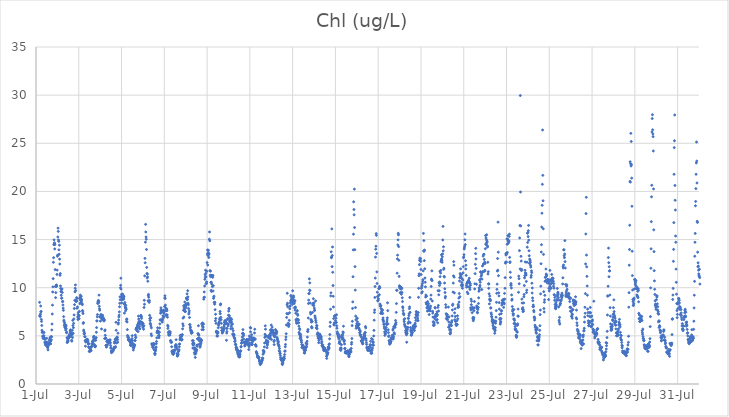
| Category | Chl (ug/L) |
|---|---|
| 44743.166666666664 | 8.48 |
| 44743.177083333336 | 7.07 |
| 44743.1875 | 7.12 |
| 44743.197916666664 | 7 |
| 44743.208333333336 | 7.26 |
| 44743.21875 | 8.1 |
| 44743.229166666664 | 7.49 |
| 44743.239583333336 | 7.54 |
| 44743.25 | 6.71 |
| 44743.260416666664 | 6.5 |
| 44743.270833333336 | 6.08 |
| 44743.28125 | 5.58 |
| 44743.291666666664 | 5.36 |
| 44743.302083333336 | 5.4 |
| 44743.3125 | 4.97 |
| 44743.322916666664 | 4.88 |
| 44743.333333333336 | 4.73 |
| 44743.34375 | 4.86 |
| 44743.354166666664 | 4.99 |
| 44743.364583333336 | 5.02 |
| 44743.375 | 5.35 |
| 44743.385416666664 | 4.82 |
| 44743.395833333336 | 4.7 |
| 44743.40625 | 4.7 |
| 44743.416666666664 | 4.29 |
| 44743.427083333336 | 4.41 |
| 44743.4375 | 4.23 |
| 44743.447916666664 | 4.08 |
| 44743.458333333336 | 4.05 |
| 44743.46875 | 4.03 |
| 44743.479166666664 | 4.09 |
| 44743.489583333336 | 4.31 |
| 44743.5 | 4.74 |
| 44743.510416666664 | 4.36 |
| 44743.520833333336 | 4.23 |
| 44743.53125 | 3.88 |
| 44743.541666666664 | 3.85 |
| 44743.552083333336 | 3.76 |
| 44743.5625 | 3.54 |
| 44743.572916666664 | 3.96 |
| 44743.583333333336 | 4.19 |
| 44743.59375 | 4.29 |
| 44743.604166666664 | 4.12 |
| 44743.614583333336 | 4.16 |
| 44743.625 | 4.55 |
| 44743.635416666664 | 4.23 |
| 44743.645833333336 | 4.78 |
| 44743.65625 | 4.63 |
| 44743.666666666664 | 4.44 |
| 44743.677083333336 | 4.41 |
| 44743.6875 | 4.17 |
| 44743.697916666664 | 4.91 |
| 44743.708333333336 | 4.89 |
| 44743.71875 | 4.58 |
| 44743.729166666664 | 4.91 |
| 44743.739583333336 | 5.61 |
| 44743.75 | 6.23 |
| 44743.760416666664 | 7.27 |
| 44743.770833333336 | 8.19 |
| 44743.78125 | 9.56 |
| 44743.791666666664 | 10.09 |
| 44743.802083333336 | 10.94 |
| 44743.8125 | 12.64 |
| 44743.822916666664 | 13.12 |
| 44743.833333333336 | 14.47 |
| 44743.84375 | 14.97 |
| 44743.854166666664 | 14.55 |
| 44743.864583333336 | 14.66 |
| 44743.875 | 14.03 |
| 44743.885416666664 | 14.48 |
| 44743.895833333336 | 11.88 |
| 44743.90625 | 10.13 |
| 44743.916666666664 | 8.97 |
| 44743.927083333336 | 9.49 |
| 44743.9375 | 10.11 |
| 44743.947916666664 | 10.26 |
| 44743.958333333336 | 10.27 |
| 44743.96875 | 10.18 |
| 44743.979166666664 | 11.38 |
| 44743.989583333336 | 11.83 |
| 44744.0 | 13.27 |
| 44744.010416666664 | 13.38 |
| 44744.020833333336 | 15.27 |
| 44744.03125 | 16.19 |
| 44744.041666666664 | 15.85 |
| 44744.052083333336 | 14.96 |
| 44744.0625 | 14.81 |
| 44744.072916666664 | 13.93 |
| 44744.083333333336 | 13.47 |
| 44744.09375 | 14.42 |
| 44744.104166666664 | 12.97 |
| 44744.114583333336 | 12.46 |
| 44744.125 | 11.29 |
| 44744.135416666664 | 11.47 |
| 44744.145833333336 | 10.19 |
| 44744.15625 | 9.93 |
| 44744.166666666664 | 9.59 |
| 44744.177083333336 | 9.22 |
| 44744.1875 | 9.79 |
| 44744.197916666664 | 8.9 |
| 44744.208333333336 | 8.93 |
| 44744.21875 | 9.87 |
| 44744.229166666664 | 9.51 |
| 44744.239583333336 | 8.56 |
| 44744.25 | 8.57 |
| 44744.260416666664 | 8.21 |
| 44744.270833333336 | 7.88 |
| 44744.28125 | 7.65 |
| 44744.291666666664 | 7 |
| 44744.302083333336 | 6.63 |
| 44744.3125 | 6.52 |
| 44744.322916666664 | 6.1 |
| 44744.333333333336 | 6.36 |
| 44744.34375 | 5.92 |
| 44744.354166666664 | 6.19 |
| 44744.364583333336 | 5.9 |
| 44744.375 | 5.79 |
| 44744.385416666664 | 5.6 |
| 44744.395833333336 | 5.94 |
| 44744.40625 | 6.1 |
| 44744.416666666664 | 5.73 |
| 44744.427083333336 | 5.32 |
| 44744.4375 | 5.38 |
| 44744.447916666664 | 4.81 |
| 44744.458333333336 | 4.31 |
| 44744.46875 | 4.34 |
| 44744.479166666664 | 4.57 |
| 44744.489583333336 | 4.43 |
| 44744.5 | 4.5 |
| 44744.510416666664 | 4.7 |
| 44744.520833333336 | 4.78 |
| 44744.53125 | 4.95 |
| 44744.541666666664 | 5.03 |
| 44744.552083333336 | 4.92 |
| 44744.5625 | 5.15 |
| 44744.572916666664 | 4.86 |
| 44744.583333333336 | 4.94 |
| 44744.59375 | 5.51 |
| 44744.604166666664 | 5.4 |
| 44744.614583333336 | 5.63 |
| 44744.625 | 5.23 |
| 44744.635416666664 | 5.07 |
| 44744.645833333336 | 5.03 |
| 44744.65625 | 5.3 |
| 44744.666666666664 | 4.54 |
| 44744.677083333336 | 4.45 |
| 44744.6875 | 5.16 |
| 44744.697916666664 | 5.58 |
| 44744.708333333336 | 4.83 |
| 44744.71875 | 6.61 |
| 44744.729166666664 | 6.07 |
| 44744.739583333336 | 5.27 |
| 44744.75 | 5.85 |
| 44744.760416666664 | 6.3 |
| 44744.770833333336 | 6.76 |
| 44744.78125 | 7.17 |
| 44744.791666666664 | 7.84 |
| 44744.802083333336 | 8.24 |
| 44744.8125 | 8.69 |
| 44744.822916666664 | 9.57 |
| 44744.833333333336 | 9.94 |
| 44744.84375 | 10.29 |
| 44744.854166666664 | 9.71 |
| 44744.864583333336 | 8.7 |
| 44744.875 | 8.56 |
| 44744.885416666664 | 8.62 |
| 44744.895833333336 | 8.97 |
| 44744.90625 | 8.61 |
| 44744.916666666664 | 7.86 |
| 44744.927083333336 | 8.9 |
| 44744.9375 | 8 |
| 44744.947916666664 | 6.96 |
| 44744.958333333336 | 6.7 |
| 44744.96875 | 7.22 |
| 44744.979166666664 | 7.43 |
| 44744.989583333336 | 7 |
| 44745.0 | 6.76 |
| 44745.010416666664 | 6.78 |
| 44745.020833333336 | 7.1 |
| 44745.03125 | 7.54 |
| 44745.041666666664 | 8.87 |
| 44745.052083333336 | 8.35 |
| 44745.0625 | 9 |
| 44745.072916666664 | 9.23 |
| 44745.083333333336 | 8.71 |
| 44745.09375 | 8.48 |
| 44745.104166666664 | 8.87 |
| 44745.114583333336 | 9.11 |
| 44745.125 | 8.61 |
| 44745.135416666664 | 8.74 |
| 44745.15625 | 8.35 |
| 44745.166666666664 | 8.24 |
| 44745.177083333336 | 7.63 |
| 44745.1875 | 7.49 |
| 44745.197916666664 | 7.32 |
| 44745.208333333336 | 6.29 |
| 44745.21875 | 6.38 |
| 44745.229166666664 | 5.6 |
| 44745.239583333336 | 5.46 |
| 44745.25 | 5.21 |
| 44745.260416666664 | 5.23 |
| 44745.270833333336 | 5.27 |
| 44745.28125 | 4.92 |
| 44745.291666666664 | 4.9 |
| 44745.302083333336 | 4.52 |
| 44745.3125 | 3.93 |
| 44745.322916666664 | 4.38 |
| 44745.333333333336 | 4.39 |
| 44745.34375 | 4.54 |
| 44745.354166666664 | 4.55 |
| 44745.364583333336 | 4.63 |
| 44745.375 | 4.63 |
| 44745.385416666664 | 4.49 |
| 44745.395833333336 | 4.56 |
| 44745.40625 | 4.64 |
| 44745.416666666664 | 4.43 |
| 44745.427083333336 | 4.47 |
| 44745.4375 | 4.23 |
| 44745.447916666664 | 4.13 |
| 44745.458333333336 | 3.85 |
| 44745.46875 | 4.19 |
| 44745.479166666664 | 3.8 |
| 44745.489583333336 | 3.38 |
| 44745.5 | 3.73 |
| 44745.510416666664 | 3.41 |
| 44745.520833333336 | 3.39 |
| 44745.53125 | 3.47 |
| 44745.541666666664 | 3.57 |
| 44745.552083333336 | 3.6 |
| 44745.5625 | 3.48 |
| 44745.572916666664 | 3.45 |
| 44745.583333333336 | 3.84 |
| 44745.59375 | 3.86 |
| 44745.604166666664 | 3.93 |
| 44745.614583333336 | 4.17 |
| 44745.625 | 4.15 |
| 44745.635416666664 | 4.22 |
| 44745.645833333336 | 4.43 |
| 44745.65625 | 4.47 |
| 44745.666666666664 | 4.4 |
| 44745.677083333336 | 4.45 |
| 44745.6875 | 4.87 |
| 44745.697916666664 | 4.67 |
| 44745.708333333336 | 4.96 |
| 44745.71875 | 4.12 |
| 44745.729166666664 | 3.99 |
| 44745.739583333336 | 4.62 |
| 44745.75 | 3.97 |
| 44745.760416666664 | 3.88 |
| 44745.770833333336 | 3.86 |
| 44745.78125 | 3.97 |
| 44745.791666666664 | 4.54 |
| 44745.802083333336 | 4.81 |
| 44745.8125 | 4.8 |
| 44745.822916666664 | 5.37 |
| 44745.833333333336 | 5.86 |
| 44745.84375 | 6.55 |
| 44745.854166666664 | 6.55 |
| 44745.864583333336 | 6.98 |
| 44745.875 | 7.21 |
| 44745.885416666664 | 8.36 |
| 44745.895833333336 | 8.49 |
| 44745.90625 | 8.58 |
| 44745.916666666664 | 8.68 |
| 44745.927083333336 | 8.43 |
| 44745.9375 | 8.6 |
| 44745.947916666664 | 9.23 |
| 44745.958333333336 | 8.07 |
| 44745.96875 | 7.82 |
| 44745.979166666664 | 7.66 |
| 44745.989583333336 | 6.99 |
| 44746.0 | 6.93 |
| 44746.010416666664 | 6.53 |
| 44746.020833333336 | 7.03 |
| 44746.03125 | 7.21 |
| 44746.041666666664 | 6.9 |
| 44746.052083333336 | 7.18 |
| 44746.0625 | 5.72 |
| 44746.072916666664 | 7.11 |
| 44746.083333333336 | 6.79 |
| 44746.09375 | 6.68 |
| 44746.104166666664 | 6.74 |
| 44746.114583333336 | 7.14 |
| 44746.125 | 6.71 |
| 44746.135416666664 | 6.93 |
| 44746.145833333336 | 6.75 |
| 44746.15625 | 6.8 |
| 44746.166666666664 | 6.74 |
| 44746.177083333336 | 6.54 |
| 44746.1875 | 6.59 |
| 44746.197916666664 | 6.67 |
| 44746.208333333336 | 4.72 |
| 44746.21875 | 5.52 |
| 44746.229166666664 | 5.62 |
| 44746.239583333336 | 5.06 |
| 44746.25 | 4.8 |
| 44746.260416666664 | 4.74 |
| 44746.270833333336 | 4.01 |
| 44746.28125 | 4.01 |
| 44746.291666666664 | 3.83 |
| 44746.302083333336 | 4.42 |
| 44746.3125 | 3.95 |
| 44746.322916666664 | 4.08 |
| 44746.333333333336 | 4.05 |
| 44746.34375 | 4.55 |
| 44746.354166666664 | 4.46 |
| 44746.364583333336 | 4.36 |
| 44746.375 | 4.37 |
| 44746.385416666664 | 4.48 |
| 44746.395833333336 | 4.52 |
| 44746.40625 | 4.44 |
| 44746.416666666664 | 4.24 |
| 44746.427083333336 | 4.26 |
| 44746.4375 | 4.56 |
| 44746.447916666664 | 4.55 |
| 44746.458333333336 | 4.35 |
| 44746.46875 | 4.58 |
| 44746.479166666664 | 4.27 |
| 44746.489583333336 | 3.99 |
| 44746.5 | 3.77 |
| 44746.510416666664 | 3.7 |
| 44746.520833333336 | 3.43 |
| 44746.53125 | 3.25 |
| 44746.541666666664 | 3.35 |
| 44746.552083333336 | 3.35 |
| 44746.5625 | 3.38 |
| 44746.572916666664 | 3.37 |
| 44746.583333333336 | 3.41 |
| 44746.59375 | 3.41 |
| 44746.604166666664 | 3.5 |
| 44746.614583333336 | 3.53 |
| 44746.625 | 3.59 |
| 44746.635416666664 | 3.68 |
| 44746.645833333336 | 3.72 |
| 44746.65625 | 3.83 |
| 44746.666666666664 | 4.26 |
| 44746.677083333336 | 4.38 |
| 44746.6875 | 4.36 |
| 44746.697916666664 | 4.66 |
| 44746.708333333336 | 3.79 |
| 44746.71875 | 3.88 |
| 44746.729166666664 | 4.56 |
| 44746.739583333336 | 6.41 |
| 44746.75 | 5.58 |
| 44746.760416666664 | 4.26 |
| 44746.770833333336 | 4.82 |
| 44746.78125 | 4.71 |
| 44746.791666666664 | 4.88 |
| 44746.802083333336 | 4.83 |
| 44746.8125 | 4.61 |
| 44746.822916666664 | 4.34 |
| 44746.833333333336 | 5.28 |
| 44746.84375 | 6.22 |
| 44746.854166666664 | 6.35 |
| 44746.864583333336 | 6.64 |
| 44746.875 | 6.96 |
| 44746.885416666664 | 7.15 |
| 44746.895833333336 | 7.49 |
| 44746.90625 | 8.02 |
| 44746.916666666664 | 8.38 |
| 44746.927083333336 | 9.05 |
| 44746.9375 | 8.75 |
| 44746.947916666664 | 9.99 |
| 44746.958333333336 | 10.25 |
| 44746.96875 | 10.99 |
| 44746.979166666664 | 9.86 |
| 44746.989583333336 | 9.09 |
| 44747.0 | 9.31 |
| 44747.010416666664 | 8.42 |
| 44747.020833333336 | 8.73 |
| 44747.03125 | 8.88 |
| 44747.041666666664 | 9.35 |
| 44747.052083333336 | 8.96 |
| 44747.0625 | 8.98 |
| 44747.072916666664 | 8.91 |
| 44747.083333333336 | 9.21 |
| 44747.09375 | 8.83 |
| 44747.104166666664 | 8.82 |
| 44747.114583333336 | 9.07 |
| 44747.125 | 8.31 |
| 44747.135416666664 | 7.36 |
| 44747.145833333336 | 8.28 |
| 44747.15625 | 8.46 |
| 44747.166666666664 | 8.02 |
| 44747.177083333336 | 7.89 |
| 44747.1875 | 7.6 |
| 44747.197916666664 | 8.17 |
| 44747.208333333336 | 7.89 |
| 44747.21875 | 7.77 |
| 44747.229166666664 | 6.51 |
| 44747.239583333336 | 6.72 |
| 44747.25 | 6.75 |
| 44747.260416666664 | 6.44 |
| 44747.270833333336 | 5.65 |
| 44747.28125 | 5.04 |
| 44747.291666666664 | 4.85 |
| 44747.302083333336 | 4.96 |
| 44747.3125 | 4.58 |
| 44747.322916666664 | 4.82 |
| 44747.333333333336 | 4.58 |
| 44747.34375 | 4.58 |
| 44747.354166666664 | 4.59 |
| 44747.364583333336 | 4.57 |
| 44747.375 | 4.48 |
| 44747.385416666664 | 4.45 |
| 44747.395833333336 | 4.58 |
| 44747.40625 | 4.29 |
| 44747.416666666664 | 4.05 |
| 44747.427083333336 | 4.01 |
| 44747.4375 | 4 |
| 44747.447916666664 | 4.06 |
| 44747.458333333336 | 4.2 |
| 44747.46875 | 4.35 |
| 44747.479166666664 | 4.48 |
| 44747.489583333336 | 4.71 |
| 44747.5 | 5.02 |
| 44747.510416666664 | 4.51 |
| 44747.520833333336 | 4.22 |
| 44747.53125 | 4.06 |
| 44747.541666666664 | 3.8 |
| 44747.552083333336 | 3.53 |
| 44747.5625 | 3.75 |
| 44747.572916666664 | 3.78 |
| 44747.583333333336 | 3.9 |
| 44747.59375 | 4.1 |
| 44747.604166666664 | 4.01 |
| 44747.614583333336 | 4.02 |
| 44747.625 | 4.51 |
| 44747.635416666664 | 4.52 |
| 44747.645833333336 | 5.08 |
| 44747.65625 | 4.83 |
| 44747.666666666664 | 4.84 |
| 44747.677083333336 | 5.68 |
| 44747.6875 | 5.78 |
| 44747.697916666664 | 5.7 |
| 44747.708333333336 | 5.86 |
| 44747.71875 | 5.54 |
| 44747.729166666664 | 5.88 |
| 44747.739583333336 | 5.94 |
| 44747.75 | 6.14 |
| 44747.760416666664 | 6.06 |
| 44747.770833333336 | 5.44 |
| 44747.78125 | 6.31 |
| 44747.791666666664 | 7.05 |
| 44747.802083333336 | 6.75 |
| 44747.8125 | 6.5 |
| 44747.822916666664 | 6.34 |
| 44747.833333333336 | 5.95 |
| 44747.84375 | 5.73 |
| 44747.854166666664 | 5.74 |
| 44747.864583333336 | 6.19 |
| 44747.875 | 6.46 |
| 44747.885416666664 | 6.5 |
| 44747.895833333336 | 7.05 |
| 44747.90625 | 7.14 |
| 44747.916666666664 | 6.97 |
| 44747.927083333336 | 7.02 |
| 44747.9375 | 6.81 |
| 44747.947916666664 | 6.41 |
| 44747.958333333336 | 6.35 |
| 44747.96875 | 6.16 |
| 44747.979166666664 | 6.33 |
| 44747.989583333336 | 6.03 |
| 44748.0 | 5.88 |
| 44748.010416666664 | 6.26 |
| 44748.020833333336 | 5.99 |
| 44748.03125 | 5.69 |
| 44748.041666666664 | 6.06 |
| 44748.052083333336 | 7.95 |
| 44748.0625 | 8.7 |
| 44748.072916666664 | 8.28 |
| 44748.083333333336 | 11.23 |
| 44748.09375 | 13.05 |
| 44748.104166666664 | 12.59 |
| 44748.114583333336 | 14.73 |
| 44748.125 | 16.58 |
| 44748.135416666664 | 15.79 |
| 44748.145833333336 | 15.27 |
| 44748.15625 | 15.04 |
| 44748.166666666664 | 13.97 |
| 44748.177083333336 | 12.11 |
| 44748.1875 | 11.48 |
| 44748.197916666664 | 11.01 |
| 44748.208333333336 | 11.42 |
| 44748.21875 | 11.12 |
| 44748.229166666664 | 10.67 |
| 44748.239583333336 | 8.65 |
| 44748.25 | 9.18 |
| 44748.260416666664 | 9.31 |
| 44748.270833333336 | 9.01 |
| 44748.28125 | 8.56 |
| 44748.291666666664 | 8.48 |
| 44748.302083333336 | 8.67 |
| 44748.3125 | 7.13 |
| 44748.322916666664 | 6.78 |
| 44748.333333333336 | 6.59 |
| 44748.34375 | 6.3 |
| 44748.354166666664 | 6.21 |
| 44748.364583333336 | 6.88 |
| 44748.375 | 6.02 |
| 44748.385416666664 | 5.2 |
| 44748.395833333336 | 5.83 |
| 44748.40625 | 5.02 |
| 44748.416666666664 | 4.18 |
| 44748.427083333336 | 4.06 |
| 44748.4375 | 4.14 |
| 44748.447916666664 | 3.97 |
| 44748.458333333336 | 3.79 |
| 44748.46875 | 4.15 |
| 44748.479166666664 | 3.82 |
| 44748.489583333336 | 3.98 |
| 44748.5 | 4.16 |
| 44748.510416666664 | 4.21 |
| 44748.520833333336 | 3.58 |
| 44748.53125 | 4.11 |
| 44748.541666666664 | 3.53 |
| 44748.552083333336 | 3.19 |
| 44748.5625 | 3.05 |
| 44748.572916666664 | 3.17 |
| 44748.583333333336 | 3.43 |
| 44748.59375 | 3.56 |
| 44748.604166666664 | 3.78 |
| 44748.614583333336 | 3.85 |
| 44748.625 | 4.19 |
| 44748.635416666664 | 4.41 |
| 44748.645833333336 | 4.79 |
| 44748.65625 | 5.34 |
| 44748.666666666664 | 5.49 |
| 44748.677083333336 | 5.53 |
| 44748.6875 | 5.84 |
| 44748.697916666664 | 5.5 |
| 44748.708333333336 | 5.49 |
| 44748.71875 | 5.3 |
| 44748.729166666664 | 4.99 |
| 44748.739583333336 | 5.06 |
| 44748.75 | 4.81 |
| 44748.760416666664 | 5.01 |
| 44748.770833333336 | 5.37 |
| 44748.78125 | 5.82 |
| 44748.791666666664 | 6.24 |
| 44748.802083333336 | 6.66 |
| 44748.8125 | 6.65 |
| 44748.822916666664 | 7.35 |
| 44748.833333333336 | 7.67 |
| 44748.84375 | 7.91 |
| 44748.854166666664 | 7.53 |
| 44748.864583333336 | 7.42 |
| 44748.875 | 7.65 |
| 44748.885416666664 | 6.67 |
| 44748.895833333336 | 6.55 |
| 44748.90625 | 6.43 |
| 44748.916666666664 | 6.67 |
| 44748.927083333336 | 6.84 |
| 44748.9375 | 7.09 |
| 44748.947916666664 | 7.55 |
| 44748.958333333336 | 7.61 |
| 44748.96875 | 7.67 |
| 44748.979166666664 | 7.44 |
| 44748.989583333336 | 7.33 |
| 44749.0 | 6.98 |
| 44749.010416666664 | 8.05 |
| 44749.020833333336 | 8.94 |
| 44749.03125 | 9.16 |
| 44749.041666666664 | 8.88 |
| 44749.052083333336 | 8.19 |
| 44749.0625 | 7.91 |
| 44749.072916666664 | 7.62 |
| 44749.083333333336 | 7.63 |
| 44749.09375 | 7.18 |
| 44749.104166666664 | 7.15 |
| 44749.114583333336 | 7.8 |
| 44749.125 | 7.62 |
| 44749.135416666664 | 7.18 |
| 44749.145833333336 | 6.94 |
| 44749.15625 | 6.1 |
| 44749.166666666664 | 5.77 |
| 44749.177083333336 | 5.97 |
| 44749.1875 | 5.36 |
| 44749.197916666664 | 5.32 |
| 44749.208333333336 | 5.11 |
| 44749.21875 | 5.07 |
| 44749.229166666664 | 5.46 |
| 44749.239583333336 | 5.39 |
| 44749.25 | 5.3 |
| 44749.260416666664 | 5.08 |
| 44749.270833333336 | 5.24 |
| 44749.28125 | 5.41 |
| 44749.291666666664 | 4.52 |
| 44749.302083333336 | 4.47 |
| 44749.3125 | 4.34 |
| 44749.322916666664 | 4.4 |
| 44749.333333333336 | 4.32 |
| 44749.34375 | 3.87 |
| 44749.354166666664 | 3.4 |
| 44749.364583333336 | 3.32 |
| 44749.375 | 3.45 |
| 44749.385416666664 | 3.16 |
| 44749.395833333336 | 3.31 |
| 44749.40625 | 3.43 |
| 44749.416666666664 | 3.07 |
| 44749.427083333336 | 3.14 |
| 44749.4375 | 3.29 |
| 44749.447916666664 | 3.23 |
| 44749.458333333336 | 3.41 |
| 44749.46875 | 3.48 |
| 44749.479166666664 | 3.51 |
| 44749.489583333336 | 3.53 |
| 44749.5 | 3.52 |
| 44749.510416666664 | 3.86 |
| 44749.520833333336 | 3.95 |
| 44749.53125 | 4.09 |
| 44749.541666666664 | 3.99 |
| 44749.552083333336 | 4.6 |
| 44749.5625 | 4.05 |
| 44749.572916666664 | 3.83 |
| 44749.583333333336 | 3.65 |
| 44749.59375 | 3.16 |
| 44749.604166666664 | 2.9 |
| 44749.614583333336 | 2.93 |
| 44749.625 | 3.05 |
| 44749.635416666664 | 3.12 |
| 44749.645833333336 | 3.03 |
| 44749.65625 | 3.36 |
| 44749.666666666664 | 3.4 |
| 44749.677083333336 | 3.46 |
| 44749.6875 | 3.57 |
| 44749.697916666664 | 3.87 |
| 44749.708333333336 | 4.12 |
| 44749.71875 | 4.16 |
| 44749.729166666664 | 4.59 |
| 44749.739583333336 | 4.75 |
| 44749.75 | 5.04 |
| 44749.760416666664 | 4.89 |
| 44749.770833333336 | 5.06 |
| 44749.78125 | 4.88 |
| 44749.791666666664 | 5.04 |
| 44749.802083333336 | 4.94 |
| 44749.8125 | 4.55 |
| 44749.822916666664 | 5.05 |
| 44749.833333333336 | 4.62 |
| 44749.84375 | 5.14 |
| 44749.854166666664 | 5.73 |
| 44749.864583333336 | 6.25 |
| 44749.875 | 6.84 |
| 44749.885416666664 | 6.04 |
| 44749.895833333336 | 7.65 |
| 44749.90625 | 8.13 |
| 44749.916666666664 | 6.96 |
| 44749.927083333336 | 7.95 |
| 44749.9375 | 7.77 |
| 44749.947916666664 | 7.74 |
| 44749.958333333336 | 8.51 |
| 44749.96875 | 7.52 |
| 44749.979166666664 | 8.17 |
| 44749.989583333336 | 7.53 |
| 44750.0 | 8.2 |
| 44750.010416666664 | 8.28 |
| 44750.020833333336 | 7.95 |
| 44750.03125 | 8.94 |
| 44750.041666666664 | 8.84 |
| 44750.052083333336 | 8.33 |
| 44750.0625 | 9.36 |
| 44750.072916666664 | 8.76 |
| 44750.083333333336 | 8.81 |
| 44750.09375 | 9.69 |
| 44750.104166666664 | 9.05 |
| 44750.114583333336 | 8.39 |
| 44750.125 | 8.22 |
| 44750.135416666664 | 7.83 |
| 44750.145833333336 | 7.27 |
| 44750.15625 | 7.38 |
| 44750.166666666664 | 7.59 |
| 44750.177083333336 | 6.9 |
| 44750.1875 | 6.18 |
| 44750.197916666664 | 6.14 |
| 44750.208333333336 | 5.82 |
| 44750.21875 | 5.92 |
| 44750.229166666664 | 5.61 |
| 44750.239583333336 | 5.56 |
| 44750.25 | 5.47 |
| 44750.260416666664 | 5.31 |
| 44750.270833333336 | 5.27 |
| 44750.28125 | 5.5 |
| 44750.291666666664 | 5.31 |
| 44750.302083333336 | 5.35 |
| 44750.3125 | 4.5 |
| 44750.322916666664 | 4.18 |
| 44750.333333333336 | 3.73 |
| 44750.34375 | 4.05 |
| 44750.354166666664 | 4.5 |
| 44750.364583333336 | 4.27 |
| 44750.375 | 4.1 |
| 44750.385416666664 | 4.21 |
| 44750.395833333336 | 3.76 |
| 44750.40625 | 3.26 |
| 44750.416666666664 | 3.55 |
| 44750.427083333336 | 3.09 |
| 44750.4375 | 3.21 |
| 44750.447916666664 | 2.76 |
| 44750.458333333336 | 3.67 |
| 44750.46875 | 3.16 |
| 44750.479166666664 | 3.32 |
| 44750.489583333336 | 3.4 |
| 44750.5 | 3.52 |
| 44750.510416666664 | 3.57 |
| 44750.520833333336 | 4 |
| 44750.53125 | 3.91 |
| 44750.541666666664 | 4.05 |
| 44750.552083333336 | 4.68 |
| 44750.5625 | 4.7 |
| 44750.572916666664 | 5.22 |
| 44750.583333333336 | 5.22 |
| 44750.59375 | 6.05 |
| 44750.604166666664 | 5.11 |
| 44750.614583333336 | 5.07 |
| 44750.625 | 4.8 |
| 44750.635416666664 | 4.49 |
| 44750.645833333336 | 4.14 |
| 44750.65625 | 4.13 |
| 44750.666666666664 | 3.82 |
| 44750.677083333336 | 4.16 |
| 44750.6875 | 3.95 |
| 44750.697916666664 | 4.66 |
| 44750.708333333336 | 4.19 |
| 44750.71875 | 4.36 |
| 44750.729166666664 | 4.59 |
| 44750.739583333336 | 4.51 |
| 44750.75 | 6.23 |
| 44750.760416666664 | 5.64 |
| 44750.770833333336 | 6.25 |
| 44750.78125 | 6.01 |
| 44750.791666666664 | 6.34 |
| 44750.802083333336 | 5.95 |
| 44750.8125 | 5.89 |
| 44750.822916666664 | 5.65 |
| 44750.833333333336 | 6.22 |
| 44750.84375 | 8.81 |
| 44750.854166666664 | 8.98 |
| 44750.864583333336 | 9.56 |
| 44750.875 | 9.02 |
| 44750.885416666664 | 10.18 |
| 44750.895833333336 | 10.87 |
| 44750.90625 | 11.33 |
| 44750.916666666664 | 11.06 |
| 44750.927083333336 | 11.82 |
| 44750.9375 | 11.49 |
| 44750.947916666664 | 11.13 |
| 44750.958333333336 | 10.44 |
| 44750.96875 | 10.43 |
| 44750.979166666664 | 10.6 |
| 44750.989583333336 | 11.7 |
| 44751.0 | 12.61 |
| 44751.010416666664 | 13.49 |
| 44751.020833333336 | 13.92 |
| 44751.03125 | 12.36 |
| 44751.041666666664 | 13.35 |
| 44751.052083333336 | 13.67 |
| 44751.0625 | 13.89 |
| 44751.072916666664 | 13.47 |
| 44751.083333333336 | 13.14 |
| 44751.09375 | 13.51 |
| 44751.104166666664 | 15.04 |
| 44751.114583333336 | 15.79 |
| 44751.125 | 14.87 |
| 44751.135416666664 | 11.78 |
| 44751.145833333336 | 11.3 |
| 44751.15625 | 11.71 |
| 44751.166666666664 | 11.14 |
| 44751.177083333336 | 10.55 |
| 44751.1875 | 9.73 |
| 44751.197916666664 | 10.57 |
| 44751.208333333336 | 9.61 |
| 44751.21875 | 10.37 |
| 44751.229166666664 | 11.29 |
| 44751.239583333336 | 11.19 |
| 44751.25 | 10.11 |
| 44751.260416666664 | 11.08 |
| 44751.270833333336 | 11.28 |
| 44751.28125 | 9.66 |
| 44751.291666666664 | 10.21 |
| 44751.302083333336 | 8.89 |
| 44751.3125 | 9.04 |
| 44751.322916666664 | 9.12 |
| 44751.333333333336 | 8.46 |
| 44751.34375 | 8.47 |
| 44751.354166666664 | 8.29 |
| 44751.364583333336 | 8.48 |
| 44751.375 | 7.72 |
| 44751.385416666664 | 6.56 |
| 44751.395833333336 | 7.24 |
| 44751.40625 | 6.8 |
| 44751.416666666664 | 6.3 |
| 44751.427083333336 | 5.39 |
| 44751.4375 | 5.49 |
| 44751.447916666664 | 5.39 |
| 44751.458333333336 | 4.98 |
| 44751.46875 | 5.34 |
| 44751.479166666664 | 5.23 |
| 44751.489583333336 | 4.98 |
| 44751.5 | 5.41 |
| 44751.510416666664 | 5.31 |
| 44751.520833333336 | 5.84 |
| 44751.53125 | 6.19 |
| 44751.541666666664 | 6.08 |
| 44751.552083333336 | 6.37 |
| 44751.5625 | 6.28 |
| 44751.572916666664 | 6.48 |
| 44751.583333333336 | 6.69 |
| 44751.59375 | 6.84 |
| 44751.604166666664 | 7.53 |
| 44751.614583333336 | 7.3 |
| 44751.625 | 8.22 |
| 44751.635416666664 | 8.32 |
| 44751.645833333336 | 6.92 |
| 44751.65625 | 6.67 |
| 44751.666666666664 | 6.3 |
| 44751.677083333336 | 5.84 |
| 44751.6875 | 5.56 |
| 44751.697916666664 | 5.55 |
| 44751.708333333336 | 5.29 |
| 44751.71875 | 5.36 |
| 44751.729166666664 | 5.44 |
| 44751.739583333336 | 5.4 |
| 44751.75 | 5.64 |
| 44751.760416666664 | 5.53 |
| 44751.770833333336 | 5.64 |
| 44751.78125 | 5.77 |
| 44751.791666666664 | 5.97 |
| 44751.802083333336 | 6.15 |
| 44751.8125 | 6.4 |
| 44751.822916666664 | 6.55 |
| 44751.833333333336 | 6.41 |
| 44751.84375 | 6.35 |
| 44751.854166666664 | 6.42 |
| 44751.864583333336 | 6.61 |
| 44751.875 | 6.26 |
| 44751.885416666664 | 6.41 |
| 44751.895833333336 | 5.78 |
| 44751.90625 | 4.54 |
| 44751.916666666664 | 5.29 |
| 44751.927083333336 | 5.45 |
| 44751.9375 | 5.77 |
| 44751.947916666664 | 6.25 |
| 44751.958333333336 | 6.79 |
| 44751.96875 | 6.7 |
| 44751.979166666664 | 6.04 |
| 44751.989583333336 | 6.21 |
| 44752.0 | 7.14 |
| 44752.010416666664 | 7.57 |
| 44752.020833333336 | 7.8 |
| 44752.03125 | 7.85 |
| 44752.041666666664 | 7.09 |
| 44752.052083333336 | 6.54 |
| 44752.0625 | 6.88 |
| 44752.072916666664 | 6.4 |
| 44752.083333333336 | 6.51 |
| 44752.09375 | 6.65 |
| 44752.104166666664 | 5.74 |
| 44752.114583333336 | 6.79 |
| 44752.125 | 5.99 |
| 44752.135416666664 | 6.49 |
| 44752.145833333336 | 6.71 |
| 44752.15625 | 6.23 |
| 44752.166666666664 | 6.19 |
| 44752.177083333336 | 6.26 |
| 44752.1875 | 5.76 |
| 44752.197916666664 | 5.19 |
| 44752.208333333336 | 5.14 |
| 44752.21875 | 5.53 |
| 44752.229166666664 | 5.21 |
| 44752.239583333336 | 4.99 |
| 44752.25 | 5.05 |
| 44752.260416666664 | 5.13 |
| 44752.270833333336 | 4.83 |
| 44752.28125 | 4.77 |
| 44752.291666666664 | 4.41 |
| 44752.302083333336 | 4.67 |
| 44752.3125 | 4.46 |
| 44752.322916666664 | 4.1 |
| 44752.333333333336 | 4.13 |
| 44752.34375 | 4.07 |
| 44752.354166666664 | 3.76 |
| 44752.364583333336 | 3.83 |
| 44752.375 | 3.57 |
| 44752.385416666664 | 3.75 |
| 44752.395833333336 | 3.47 |
| 44752.40625 | 3.62 |
| 44752.416666666664 | 3.54 |
| 44752.427083333336 | 3.24 |
| 44752.4375 | 3.11 |
| 44752.447916666664 | 3.42 |
| 44752.458333333336 | 3.28 |
| 44752.46875 | 2.89 |
| 44752.479166666664 | 3.06 |
| 44752.489583333336 | 3.05 |
| 44752.5 | 2.79 |
| 44752.510416666664 | 2.95 |
| 44752.520833333336 | 3 |
| 44752.53125 | 2.83 |
| 44752.541666666664 | 3.1 |
| 44752.552083333336 | 3.4 |
| 44752.5625 | 3.38 |
| 44752.572916666664 | 3.45 |
| 44752.583333333336 | 3.84 |
| 44752.59375 | 3.9 |
| 44752.604166666664 | 4.23 |
| 44752.614583333336 | 4.27 |
| 44752.625 | 4.5 |
| 44752.635416666664 | 4.57 |
| 44752.645833333336 | 4.86 |
| 44752.65625 | 5.25 |
| 44752.666666666664 | 5.26 |
| 44752.677083333336 | 5.65 |
| 44752.6875 | 5.16 |
| 44752.697916666664 | 5.22 |
| 44752.708333333336 | 5.03 |
| 44752.71875 | 4.66 |
| 44752.729166666664 | 4.35 |
| 44752.739583333336 | 4.34 |
| 44752.75 | 4.28 |
| 44752.760416666664 | 3.95 |
| 44752.770833333336 | 4.14 |
| 44752.78125 | 4 |
| 44752.791666666664 | 4.12 |
| 44752.802083333336 | 4.21 |
| 44752.8125 | 4.2 |
| 44752.822916666664 | 4.34 |
| 44752.833333333336 | 4.44 |
| 44752.84375 | 4.59 |
| 44752.854166666664 | 4.49 |
| 44752.864583333336 | 4.63 |
| 44752.875 | 4.57 |
| 44752.885416666664 | 4.42 |
| 44752.895833333336 | 4.52 |
| 44752.90625 | 4.52 |
| 44752.916666666664 | 4.16 |
| 44752.927083333336 | 4.15 |
| 44752.9375 | 4.02 |
| 44752.947916666664 | 3.58 |
| 44752.958333333336 | 3.88 |
| 44752.96875 | 4.71 |
| 44752.979166666664 | 4.98 |
| 44752.989583333336 | 4.27 |
| 44753.0 | 4.09 |
| 44753.010416666664 | 4.6 |
| 44753.020833333336 | 5.86 |
| 44753.03125 | 5.42 |
| 44753.041666666664 | 5.82 |
| 44753.052083333336 | 4.85 |
| 44753.0625 | 4.6 |
| 44753.072916666664 | 4.87 |
| 44753.083333333336 | 5.12 |
| 44753.09375 | 4.08 |
| 44753.104166666664 | 4.3 |
| 44753.114583333336 | 4.11 |
| 44753.125 | 4.42 |
| 44753.135416666664 | 4.6 |
| 44753.145833333336 | 4.57 |
| 44753.15625 | 4.76 |
| 44753.166666666664 | 4.7 |
| 44753.177083333336 | 4.7 |
| 44753.1875 | 4.77 |
| 44753.197916666664 | 4.57 |
| 44753.208333333336 | 4.67 |
| 44753.21875 | 5.3 |
| 44753.229166666664 | 5.69 |
| 44753.239583333336 | 4.68 |
| 44753.25 | 4.66 |
| 44753.260416666664 | 4.08 |
| 44753.270833333336 | 4.08 |
| 44753.28125 | 3.97 |
| 44753.291666666664 | 3.92 |
| 44753.302083333336 | 3.36 |
| 44753.3125 | 3.25 |
| 44753.322916666664 | 3.22 |
| 44753.333333333336 | 3.15 |
| 44753.34375 | 3.01 |
| 44753.354166666664 | 2.89 |
| 44753.364583333336 | 2.76 |
| 44753.375 | 2.87 |
| 44753.385416666664 | 2.76 |
| 44753.395833333336 | 2.72 |
| 44753.40625 | 2.73 |
| 44753.416666666664 | 2.79 |
| 44753.427083333336 | 2.77 |
| 44753.4375 | 2.51 |
| 44753.447916666664 | 2.37 |
| 44753.458333333336 | 2.41 |
| 44753.46875 | 2.14 |
| 44753.479166666664 | 2.22 |
| 44753.489583333336 | 2.01 |
| 44753.5 | 2.1 |
| 44753.510416666664 | 2.26 |
| 44753.520833333336 | 2.18 |
| 44753.53125 | 2.17 |
| 44753.541666666664 | 2.26 |
| 44753.552083333336 | 2.44 |
| 44753.5625 | 2.4 |
| 44753.572916666664 | 2.45 |
| 44753.583333333336 | 2.66 |
| 44753.59375 | 2.71 |
| 44753.604166666664 | 2.63 |
| 44753.614583333336 | 3.09 |
| 44753.625 | 3.47 |
| 44753.635416666664 | 3.47 |
| 44753.645833333336 | 3.24 |
| 44753.65625 | 3.43 |
| 44753.666666666664 | 3.33 |
| 44753.677083333336 | 3.85 |
| 44753.6875 | 4.26 |
| 44753.697916666664 | 4.84 |
| 44753.708333333336 | 5.17 |
| 44753.71875 | 6.04 |
| 44753.729166666664 | 5.69 |
| 44753.739583333336 | 4.95 |
| 44753.75 | 5.02 |
| 44753.760416666664 | 4.32 |
| 44753.770833333336 | 4.56 |
| 44753.78125 | 4.47 |
| 44753.791666666664 | 4.21 |
| 44753.802083333336 | 3.77 |
| 44753.8125 | 4.03 |
| 44753.822916666664 | 4.15 |
| 44753.833333333336 | 4.33 |
| 44753.84375 | 4.44 |
| 44753.854166666664 | 4.84 |
| 44753.864583333336 | 4.99 |
| 44753.875 | 4.96 |
| 44753.885416666664 | 4.93 |
| 44753.895833333336 | 4.97 |
| 44753.90625 | 4.97 |
| 44753.916666666664 | 4.72 |
| 44753.927083333336 | 4.98 |
| 44753.9375 | 5.16 |
| 44753.947916666664 | 4.82 |
| 44753.958333333336 | 5.58 |
| 44753.96875 | 5.03 |
| 44753.979166666664 | 5.35 |
| 44753.989583333336 | 5.66 |
| 44754.0 | 6.12 |
| 44754.010416666664 | 4.62 |
| 44754.020833333336 | 5.29 |
| 44754.03125 | 5.61 |
| 44754.041666666664 | 5.91 |
| 44754.052083333336 | 5.51 |
| 44754.0625 | 5.37 |
| 44754.072916666664 | 5.44 |
| 44754.083333333336 | 5.58 |
| 44754.09375 | 5.26 |
| 44754.104166666664 | 5.2 |
| 44754.114583333336 | 5.02 |
| 44754.125 | 4.41 |
| 44754.135416666664 | 4.09 |
| 44754.145833333336 | 4.53 |
| 44754.15625 | 4.9 |
| 44754.166666666664 | 4.97 |
| 44754.177083333336 | 5.3 |
| 44754.1875 | 5.32 |
| 44754.197916666664 | 5.65 |
| 44754.208333333336 | 5.32 |
| 44754.21875 | 5.25 |
| 44754.229166666664 | 5.38 |
| 44754.239583333336 | 5.2 |
| 44754.25 | 5.49 |
| 44754.260416666664 | 5.39 |
| 44754.270833333336 | 4.83 |
| 44754.28125 | 4.71 |
| 44754.291666666664 | 4.61 |
| 44754.302083333336 | 4.47 |
| 44754.3125 | 4.17 |
| 44754.322916666664 | 4.29 |
| 44754.333333333336 | 4.42 |
| 44754.34375 | 4.07 |
| 44754.354166666664 | 4 |
| 44754.364583333336 | 3.89 |
| 44754.375 | 3.46 |
| 44754.385416666664 | 3.69 |
| 44754.395833333336 | 3.36 |
| 44754.40625 | 3.17 |
| 44754.416666666664 | 3.19 |
| 44754.427083333336 | 2.96 |
| 44754.4375 | 2.75 |
| 44754.447916666664 | 2.54 |
| 44754.458333333336 | 2.6 |
| 44754.46875 | 2.64 |
| 44754.479166666664 | 2.49 |
| 44754.489583333336 | 2.41 |
| 44754.5 | 2.52 |
| 44754.510416666664 | 2.1 |
| 44754.520833333336 | 2.02 |
| 44754.53125 | 2.14 |
| 44754.541666666664 | 2.22 |
| 44754.552083333336 | 2.42 |
| 44754.5625 | 2.68 |
| 44754.572916666664 | 2.5 |
| 44754.583333333336 | 2.5 |
| 44754.59375 | 2.63 |
| 44754.604166666664 | 2.83 |
| 44754.614583333336 | 2.65 |
| 44754.625 | 3.06 |
| 44754.635416666664 | 3.39 |
| 44754.645833333336 | 3.44 |
| 44754.65625 | 3.87 |
| 44754.666666666664 | 4.11 |
| 44754.677083333336 | 4.61 |
| 44754.6875 | 4.88 |
| 44754.697916666664 | 5.22 |
| 44754.708333333336 | 6.13 |
| 44754.71875 | 6.91 |
| 44754.729166666664 | 7.32 |
| 44754.739583333336 | 8.22 |
| 44754.75 | 9.42 |
| 44754.760416666664 | 8.39 |
| 44754.770833333336 | 8.01 |
| 44754.78125 | 7.28 |
| 44754.791666666664 | 6.32 |
| 44754.802083333336 | 6.08 |
| 44754.8125 | 5.97 |
| 44754.822916666664 | 6.21 |
| 44754.833333333336 | 6.2 |
| 44754.84375 | 6.61 |
| 44754.854166666664 | 7.4 |
| 44754.864583333336 | 7.81 |
| 44754.875 | 8.07 |
| 44754.885416666664 | 8.13 |
| 44754.895833333336 | 8.42 |
| 44754.90625 | 8.65 |
| 44754.916666666664 | 9.19 |
| 44754.927083333336 | 9.13 |
| 44754.9375 | 8.59 |
| 44754.947916666664 | 8.82 |
| 44754.958333333336 | 9.01 |
| 44754.96875 | 8.73 |
| 44754.979166666664 | 8.63 |
| 44754.989583333336 | 8.28 |
| 44755.0 | 9.68 |
| 44755.010416666664 | 8.42 |
| 44755.020833333336 | 8.58 |
| 44755.03125 | 8.79 |
| 44755.041666666664 | 9.15 |
| 44755.052083333336 | 9.02 |
| 44755.0625 | 8.55 |
| 44755.072916666664 | 8.36 |
| 44755.083333333336 | 7.92 |
| 44755.09375 | 8.56 |
| 44755.104166666664 | 8.66 |
| 44755.114583333336 | 7.67 |
| 44755.125 | 8 |
| 44755.135416666664 | 7.91 |
| 44755.145833333336 | 7.35 |
| 44755.15625 | 6.66 |
| 44755.166666666664 | 6.65 |
| 44755.177083333336 | 6.44 |
| 44755.1875 | 6.3 |
| 44755.197916666664 | 6.77 |
| 44755.208333333336 | 7.57 |
| 44755.21875 | 7.63 |
| 44755.229166666664 | 7.25 |
| 44755.239583333336 | 7.13 |
| 44755.25 | 6.7 |
| 44755.260416666664 | 6.34 |
| 44755.270833333336 | 6.64 |
| 44755.28125 | 6.37 |
| 44755.291666666664 | 6 |
| 44755.302083333336 | 5.36 |
| 44755.3125 | 5.2 |
| 44755.322916666664 | 5.75 |
| 44755.333333333336 | 5.65 |
| 44755.34375 | 4.75 |
| 44755.354166666664 | 5.06 |
| 44755.364583333336 | 4.94 |
| 44755.375 | 5.16 |
| 44755.385416666664 | 4.81 |
| 44755.395833333336 | 4.6 |
| 44755.40625 | 4.5 |
| 44755.416666666664 | 4.33 |
| 44755.427083333336 | 4.1 |
| 44755.4375 | 3.77 |
| 44755.447916666664 | 3.82 |
| 44755.458333333336 | 3.94 |
| 44755.46875 | 3.96 |
| 44755.479166666664 | 3.87 |
| 44755.489583333336 | 4.03 |
| 44755.5 | 3.86 |
| 44755.510416666664 | 3.85 |
| 44755.520833333336 | 3.65 |
| 44755.53125 | 3.52 |
| 44755.541666666664 | 3.23 |
| 44755.552083333336 | 3.45 |
| 44755.5625 | 3.22 |
| 44755.572916666664 | 3.51 |
| 44755.583333333336 | 3.46 |
| 44755.59375 | 3.75 |
| 44755.604166666664 | 3.52 |
| 44755.614583333336 | 3.79 |
| 44755.625 | 4.25 |
| 44755.635416666664 | 3.82 |
| 44755.645833333336 | 3.93 |
| 44755.65625 | 4.17 |
| 44755.666666666664 | 4.15 |
| 44755.677083333336 | 4.44 |
| 44755.6875 | 4.87 |
| 44755.697916666664 | 5.47 |
| 44755.708333333336 | 5.45 |
| 44755.71875 | 5.66 |
| 44755.729166666664 | 6.85 |
| 44755.739583333336 | 8.36 |
| 44755.75 | 8.71 |
| 44755.760416666664 | 9.38 |
| 44755.770833333336 | 9.4 |
| 44755.78125 | 10.92 |
| 44755.791666666664 | 9.75 |
| 44755.802083333336 | 10.5 |
| 44755.8125 | 9.7 |
| 44755.822916666664 | 8.41 |
| 44755.833333333336 | 7.44 |
| 44755.84375 | 7.27 |
| 44755.854166666664 | 6.69 |
| 44755.864583333336 | 6.64 |
| 44755.875 | 6.43 |
| 44755.885416666664 | 5.96 |
| 44755.895833333336 | 5.84 |
| 44755.90625 | 5.83 |
| 44755.916666666664 | 6.49 |
| 44755.927083333336 | 7.43 |
| 44755.9375 | 8.21 |
| 44755.947916666664 | 8.35 |
| 44755.958333333336 | 8.3 |
| 44755.96875 | 8.86 |
| 44755.979166666664 | 8.36 |
| 44755.989583333336 | 8.15 |
| 44756.0 | 8.43 |
| 44756.010416666664 | 7.89 |
| 44756.020833333336 | 7.62 |
| 44756.03125 | 7.68 |
| 44756.041666666664 | 7.07 |
| 44756.052083333336 | 6.96 |
| 44756.0625 | 6.8 |
| 44756.072916666664 | 8.63 |
| 44756.083333333336 | 6.6 |
| 44756.09375 | 6.4 |
| 44756.104166666664 | 5.83 |
| 44756.114583333336 | 5.82 |
| 44756.125 | 6.08 |
| 44756.135416666664 | 6.04 |
| 44756.145833333336 | 5.73 |
| 44756.15625 | 5.14 |
| 44756.166666666664 | 5.2 |
| 44756.177083333336 | 5.32 |
| 44756.1875 | 4.92 |
| 44756.197916666664 | 4.74 |
| 44756.208333333336 | 4.8 |
| 44756.21875 | 4.29 |
| 44756.229166666664 | 4.53 |
| 44756.239583333336 | 5.06 |
| 44756.25 | 5.04 |
| 44756.260416666664 | 4.75 |
| 44756.270833333336 | 5.17 |
| 44756.28125 | 5.1 |
| 44756.291666666664 | 4.97 |
| 44756.302083333336 | 4.8 |
| 44756.3125 | 4.91 |
| 44756.322916666664 | 4.85 |
| 44756.333333333336 | 4.92 |
| 44756.34375 | 4.66 |
| 44756.354166666664 | 4.25 |
| 44756.364583333336 | 4.41 |
| 44756.375 | 3.97 |
| 44756.385416666664 | 4 |
| 44756.395833333336 | 3.92 |
| 44756.40625 | 4.07 |
| 44756.416666666664 | 3.77 |
| 44756.427083333336 | 3.88 |
| 44756.4375 | 3.82 |
| 44756.447916666664 | 3.56 |
| 44756.458333333336 | 3.46 |
| 44756.46875 | 3.53 |
| 44756.479166666664 | 3.61 |
| 44756.489583333336 | 3.67 |
| 44756.5 | 3.73 |
| 44756.510416666664 | 3.62 |
| 44756.520833333336 | 3.56 |
| 44756.53125 | 3.43 |
| 44756.541666666664 | 3.56 |
| 44756.552083333336 | 3.42 |
| 44756.5625 | 3.46 |
| 44756.572916666664 | 3.37 |
| 44756.583333333336 | 2.88 |
| 44756.59375 | 2.66 |
| 44756.604166666664 | 3.15 |
| 44756.614583333336 | 3.03 |
| 44756.625 | 3.05 |
| 44756.635416666664 | 3.23 |
| 44756.645833333336 | 3.25 |
| 44756.65625 | 3.8 |
| 44756.666666666664 | 3.56 |
| 44756.677083333336 | 3.86 |
| 44756.6875 | 3.66 |
| 44756.697916666664 | 4.09 |
| 44756.708333333336 | 3.75 |
| 44756.71875 | 4.17 |
| 44756.729166666664 | 4.69 |
| 44756.739583333336 | 5.14 |
| 44756.75 | 5.98 |
| 44756.760416666664 | 6.41 |
| 44756.770833333336 | 7.76 |
| 44756.78125 | 9.15 |
| 44756.791666666664 | 9.47 |
| 44756.802083333336 | 13.73 |
| 44756.8125 | 13.11 |
| 44756.822916666664 | 13.2 |
| 44756.833333333336 | 16.11 |
| 44756.84375 | 12.19 |
| 44756.854166666664 | 13.34 |
| 44756.864583333336 | 14.23 |
| 44756.875 | 11.6 |
| 44756.885416666664 | 10.23 |
| 44756.895833333336 | 9.11 |
| 44756.90625 | 8 |
| 44756.916666666664 | 6.8 |
| 44756.927083333336 | 6.21 |
| 44756.9375 | 6.12 |
| 44756.947916666664 | 6.35 |
| 44756.958333333336 | 7.05 |
| 44756.96875 | 7.07 |
| 44756.979166666664 | 7.06 |
| 44756.989583333336 | 7.11 |
| 44757.0 | 6.59 |
| 44757.010416666664 | 6.36 |
| 44757.020833333336 | 6.39 |
| 44757.03125 | 6.84 |
| 44757.041666666664 | 6.4 |
| 44757.052083333336 | 7.19 |
| 44757.0625 | 6.05 |
| 44757.072916666664 | 5.79 |
| 44757.083333333336 | 5.42 |
| 44757.09375 | 5.22 |
| 44757.104166666664 | 5.2 |
| 44757.114583333336 | 5.25 |
| 44757.125 | 5.07 |
| 44757.135416666664 | 4.91 |
| 44757.145833333336 | 4.89 |
| 44757.15625 | 4.69 |
| 44757.166666666664 | 5.1 |
| 44757.177083333336 | 4.23 |
| 44757.1875 | 4.34 |
| 44757.197916666664 | 4.43 |
| 44757.208333333336 | 4.86 |
| 44757.21875 | 4.19 |
| 44757.229166666664 | 3.6 |
| 44757.239583333336 | 3.74 |
| 44757.25 | 3.49 |
| 44757.260416666664 | 3.61 |
| 44757.270833333336 | 3.73 |
| 44757.28125 | 4.08 |
| 44757.291666666664 | 4.99 |
| 44757.302083333336 | 4.66 |
| 44757.3125 | 4.84 |
| 44757.322916666664 | 5.03 |
| 44757.333333333336 | 5.14 |
| 44757.34375 | 4.83 |
| 44757.354166666664 | 5.41 |
| 44757.364583333336 | 5.32 |
| 44757.375 | 6 |
| 44757.385416666664 | 4.6 |
| 44757.395833333336 | 4.58 |
| 44757.40625 | 4.4 |
| 44757.416666666664 | 4.51 |
| 44757.427083333336 | 4.16 |
| 44757.4375 | 3.66 |
| 44757.447916666664 | 3.71 |
| 44757.458333333336 | 3.25 |
| 44757.46875 | 3.35 |
| 44757.479166666664 | 3.39 |
| 44757.489583333336 | 3.32 |
| 44757.5 | 3.24 |
| 44757.510416666664 | 3.19 |
| 44757.520833333336 | 3.31 |
| 44757.53125 | 3.29 |
| 44757.541666666664 | 3.26 |
| 44757.552083333336 | 3.4 |
| 44757.5625 | 3.28 |
| 44757.572916666664 | 3.46 |
| 44757.583333333336 | 3.24 |
| 44757.59375 | 3.38 |
| 44757.604166666664 | 3.28 |
| 44757.614583333336 | 3.03 |
| 44757.625 | 2.89 |
| 44757.635416666664 | 2.83 |
| 44757.645833333336 | 3.27 |
| 44757.65625 | 3.06 |
| 44757.666666666664 | 3.47 |
| 44757.677083333336 | 3.33 |
| 44757.6875 | 3.57 |
| 44757.697916666664 | 3.3 |
| 44757.708333333336 | 3.48 |
| 44757.71875 | 3.34 |
| 44757.729166666664 | 3.33 |
| 44757.739583333336 | 3.7 |
| 44757.75 | 4.13 |
| 44757.760416666664 | 4.32 |
| 44757.770833333336 | 4.72 |
| 44757.78125 | 6.07 |
| 44757.791666666664 | 6.51 |
| 44757.802083333336 | 7.85 |
| 44757.8125 | 8.53 |
| 44757.822916666664 | 11.14 |
| 44757.833333333336 | 13.93 |
| 44757.84375 | 15.56 |
| 44757.854166666664 | 18.92 |
| 44757.864583333336 | 18.12 |
| 44757.875 | 17.57 |
| 44757.885416666664 | 20.24 |
| 44757.895833333336 | 16.25 |
| 44757.90625 | 13.95 |
| 44757.916666666664 | 12.19 |
| 44757.927083333336 | 9.75 |
| 44757.9375 | 7.94 |
| 44757.947916666664 | 7.05 |
| 44757.958333333336 | 6.66 |
| 44757.96875 | 5.79 |
| 44757.979166666664 | 6.03 |
| 44757.989583333336 | 6.04 |
| 44758.0 | 6.26 |
| 44758.010416666664 | 6.84 |
| 44758.020833333336 | 6.82 |
| 44758.03125 | 6.46 |
| 44758.041666666664 | 6.12 |
| 44758.052083333336 | 5.89 |
| 44758.0625 | 6.05 |
| 44758.072916666664 | 6.15 |
| 44758.083333333336 | 6.21 |
| 44758.09375 | 5.82 |
| 44758.104166666664 | 5.74 |
| 44758.114583333336 | 6.21 |
| 44758.125 | 5.59 |
| 44758.135416666664 | 5.33 |
| 44758.145833333336 | 5.31 |
| 44758.15625 | 5.1 |
| 44758.166666666664 | 5.5 |
| 44758.177083333336 | 5.04 |
| 44758.1875 | 5.07 |
| 44758.197916666664 | 4.9 |
| 44758.208333333336 | 4.48 |
| 44758.21875 | 4.45 |
| 44758.229166666664 | 4.52 |
| 44758.239583333336 | 4.37 |
| 44758.25 | 4.69 |
| 44758.260416666664 | 4.27 |
| 44758.270833333336 | 4.17 |
| 44758.28125 | 4.2 |
| 44758.291666666664 | 4.53 |
| 44758.302083333336 | 4.77 |
| 44758.3125 | 4.87 |
| 44758.322916666664 | 4.7 |
| 44758.333333333336 | 5.17 |
| 44758.34375 | 4.84 |
| 44758.354166666664 | 4.92 |
| 44758.364583333336 | 5.02 |
| 44758.375 | 5.07 |
| 44758.385416666664 | 5.32 |
| 44758.395833333336 | 5.36 |
| 44758.40625 | 5.97 |
| 44758.416666666664 | 5.83 |
| 44758.427083333336 | 4.71 |
| 44758.4375 | 4.55 |
| 44758.447916666664 | 4.31 |
| 44758.458333333336 | 4.11 |
| 44758.46875 | 3.82 |
| 44758.479166666664 | 3.74 |
| 44758.489583333336 | 3.72 |
| 44758.5 | 3.66 |
| 44758.510416666664 | 3.56 |
| 44758.520833333336 | 3.48 |
| 44758.53125 | 3.49 |
| 44758.541666666664 | 3.54 |
| 44758.552083333336 | 3.79 |
| 44758.5625 | 3.61 |
| 44758.572916666664 | 3.75 |
| 44758.583333333336 | 3.57 |
| 44758.59375 | 3.82 |
| 44758.604166666664 | 3.77 |
| 44758.614583333336 | 3.93 |
| 44758.625 | 4.09 |
| 44758.635416666664 | 3.42 |
| 44758.645833333336 | 4.43 |
| 44758.65625 | 4.03 |
| 44758.666666666664 | 3.19 |
| 44758.677083333336 | 3.26 |
| 44758.6875 | 4.72 |
| 44758.697916666664 | 3.18 |
| 44758.708333333336 | 3.47 |
| 44758.71875 | 3.64 |
| 44758.729166666664 | 3.75 |
| 44758.739583333336 | 4.61 |
| 44758.75 | 4.05 |
| 44758.760416666664 | 4.29 |
| 44758.770833333336 | 4.36 |
| 44758.78125 | 4.03 |
| 44758.791666666664 | 4.99 |
| 44758.802083333336 | 5.57 |
| 44758.8125 | 6.63 |
| 44758.822916666664 | 7.43 |
| 44758.833333333336 | 7.69 |
| 44758.84375 | 8.99 |
| 44758.854166666664 | 10.13 |
| 44758.864583333336 | 11 |
| 44758.875 | 13.18 |
| 44758.885416666664 | 14 |
| 44758.895833333336 | 14.31 |
| 44758.90625 | 15.62 |
| 44758.916666666664 | 15.44 |
| 44758.927083333336 | 13.56 |
| 44758.9375 | 11.64 |
| 44758.947916666664 | 10.44 |
| 44758.958333333336 | 9.53 |
| 44758.96875 | 9.08 |
| 44758.979166666664 | 8.63 |
| 44758.989583333336 | 8.68 |
| 44759.0 | 8.72 |
| 44759.010416666664 | 8.87 |
| 44759.020833333336 | 9.19 |
| 44759.03125 | 9.91 |
| 44759.041666666664 | 9.91 |
| 44759.052083333336 | 9.28 |
| 44759.0625 | 10.13 |
| 44759.072916666664 | 10.01 |
| 44759.083333333336 | 8.31 |
| 44759.09375 | 8.16 |
| 44759.104166666664 | 8.06 |
| 44759.114583333336 | 7.34 |
| 44759.125 | 8.14 |
| 44759.135416666664 | 7.83 |
| 44759.145833333336 | 7.35 |
| 44759.15625 | 7.55 |
| 44759.166666666664 | 7.38 |
| 44759.177083333336 | 7.41 |
| 44759.1875 | 7.71 |
| 44759.197916666664 | 7.65 |
| 44759.208333333336 | 7.31 |
| 44759.21875 | 6.69 |
| 44759.229166666664 | 6.86 |
| 44759.239583333336 | 6.58 |
| 44759.25 | 6.46 |
| 44759.260416666664 | 6.22 |
| 44759.270833333336 | 6.19 |
| 44759.28125 | 5.93 |
| 44759.291666666664 | 5.77 |
| 44759.302083333336 | 5.42 |
| 44759.3125 | 5.05 |
| 44759.322916666664 | 5.27 |
| 44759.333333333336 | 5.4 |
| 44759.34375 | 5.2 |
| 44759.354166666664 | 5.44 |
| 44759.364583333336 | 5.64 |
| 44759.375 | 5.87 |
| 44759.385416666664 | 6.26 |
| 44759.395833333336 | 6.15 |
| 44759.40625 | 6.44 |
| 44759.416666666664 | 6.65 |
| 44759.427083333336 | 6.87 |
| 44759.4375 | 8.43 |
| 44759.447916666664 | 7.62 |
| 44759.458333333336 | 6.24 |
| 44759.46875 | 5.63 |
| 44759.479166666664 | 5.34 |
| 44759.489583333336 | 4.92 |
| 44759.5 | 5.01 |
| 44759.510416666664 | 4.49 |
| 44759.520833333336 | 4.51 |
| 44759.53125 | 4.28 |
| 44759.541666666664 | 4.13 |
| 44759.552083333336 | 4.21 |
| 44759.5625 | 4.33 |
| 44759.572916666664 | 4.25 |
| 44759.583333333336 | 4.39 |
| 44759.59375 | 4.4 |
| 44759.604166666664 | 4.69 |
| 44759.614583333336 | 4.81 |
| 44759.625 | 4.8 |
| 44759.635416666664 | 4.64 |
| 44759.645833333336 | 4.77 |
| 44759.65625 | 5.04 |
| 44759.666666666664 | 4.82 |
| 44759.677083333336 | 5.08 |
| 44759.6875 | 5.6 |
| 44759.697916666664 | 5.71 |
| 44759.708333333336 | 4.68 |
| 44759.71875 | 4.89 |
| 44759.729166666664 | 5.94 |
| 44759.739583333336 | 5.91 |
| 44759.75 | 5.32 |
| 44759.760416666664 | 5.19 |
| 44759.770833333336 | 5.92 |
| 44759.78125 | 6.1 |
| 44759.791666666664 | 5.88 |
| 44759.802083333336 | 6.21 |
| 44759.8125 | 6.6 |
| 44759.822916666664 | 6.18 |
| 44759.833333333336 | 6.37 |
| 44759.84375 | 7.44 |
| 44759.854166666664 | 8.35 |
| 44759.864583333336 | 9.73 |
| 44759.875 | 9.73 |
| 44759.885416666664 | 11.51 |
| 44759.895833333336 | 13 |
| 44759.90625 | 13.38 |
| 44759.916666666664 | 14.45 |
| 44759.927083333336 | 14.97 |
| 44759.9375 | 15.65 |
| 44759.947916666664 | 15.49 |
| 44759.958333333336 | 14.27 |
| 44759.96875 | 12.85 |
| 44759.979166666664 | 11.17 |
| 44759.989583333336 | 10.2 |
| 44760.0 | 10.07 |
| 44760.010416666664 | 9.95 |
| 44760.020833333336 | 10.15 |
| 44760.03125 | 9.49 |
| 44760.041666666664 | 10.07 |
| 44760.052083333336 | 9.46 |
| 44760.0625 | 10.04 |
| 44760.072916666664 | 9.84 |
| 44760.083333333336 | 9.32 |
| 44760.09375 | 9.97 |
| 44760.104166666664 | 9.95 |
| 44760.114583333336 | 9.51 |
| 44760.125 | 8.95 |
| 44760.135416666664 | 8.56 |
| 44760.145833333336 | 8.02 |
| 44760.15625 | 7.91 |
| 44760.166666666664 | 7.62 |
| 44760.177083333336 | 7.33 |
| 44760.1875 | 7.31 |
| 44760.197916666664 | 7.19 |
| 44760.208333333336 | 6.66 |
| 44760.21875 | 6.47 |
| 44760.229166666664 | 6.21 |
| 44760.239583333336 | 6.79 |
| 44760.25 | 6.07 |
| 44760.260416666664 | 6 |
| 44760.270833333336 | 5.95 |
| 44760.28125 | 5.53 |
| 44760.291666666664 | 5.34 |
| 44760.302083333336 | 5.72 |
| 44760.3125 | 5.22 |
| 44760.322916666664 | 5.11 |
| 44760.333333333336 | 4.34 |
| 44760.34375 | 5.46 |
| 44760.354166666664 | 5.25 |
| 44760.364583333336 | 5.64 |
| 44760.375 | 5.87 |
| 44760.385416666664 | 5.87 |
| 44760.395833333336 | 6.3 |
| 44760.40625 | 6.82 |
| 44760.416666666664 | 6.81 |
| 44760.427083333336 | 6.48 |
| 44760.4375 | 7.11 |
| 44760.447916666664 | 7.3 |
| 44760.458333333336 | 7.83 |
| 44760.46875 | 8.01 |
| 44760.479166666664 | 8.99 |
| 44760.489583333336 | 7.45 |
| 44760.5 | 6.36 |
| 44760.510416666664 | 5.86 |
| 44760.520833333336 | 5.6 |
| 44760.53125 | 5.44 |
| 44760.541666666664 | 5.07 |
| 44760.552083333336 | 5.09 |
| 44760.5625 | 5.15 |
| 44760.572916666664 | 5.23 |
| 44760.583333333336 | 5.33 |
| 44760.59375 | 5.35 |
| 44760.604166666664 | 5.54 |
| 44760.614583333336 | 5.76 |
| 44760.625 | 5.75 |
| 44760.635416666664 | 5.99 |
| 44760.645833333336 | 6.07 |
| 44760.65625 | 6.01 |
| 44760.666666666664 | 5.74 |
| 44760.677083333336 | 5.84 |
| 44760.6875 | 5.93 |
| 44760.697916666664 | 5.56 |
| 44760.708333333336 | 5.87 |
| 44760.71875 | 6.2 |
| 44760.729166666664 | 6.32 |
| 44760.739583333336 | 6.89 |
| 44760.75 | 6 |
| 44760.760416666664 | 6.61 |
| 44760.770833333336 | 7.23 |
| 44760.78125 | 7.53 |
| 44760.791666666664 | 7.12 |
| 44760.802083333336 | 7.46 |
| 44760.8125 | 7.1 |
| 44760.822916666664 | 7.25 |
| 44760.833333333336 | 6.59 |
| 44760.84375 | 6.84 |
| 44760.854166666664 | 7.12 |
| 44760.864583333336 | 6.59 |
| 44760.875 | 7.42 |
| 44760.885416666664 | 9 |
| 44760.895833333336 | 9.94 |
| 44760.90625 | 11.25 |
| 44760.916666666664 | 11.44 |
| 44760.927083333336 | 12.4 |
| 44760.9375 | 12.86 |
| 44760.947916666664 | 13.07 |
| 44760.958333333336 | 12.78 |
| 44760.96875 | 12.98 |
| 44760.979166666664 | 13.03 |
| 44760.989583333336 | 12.73 |
| 44761.0 | 11.9 |
| 44761.010416666664 | 11.37 |
| 44761.020833333336 | 9.94 |
| 44761.03125 | 9.46 |
| 44761.041666666664 | 10.12 |
| 44761.052083333336 | 10.26 |
| 44761.0625 | 9.58 |
| 44761.072916666664 | 10.46 |
| 44761.083333333336 | 10.68 |
| 44761.09375 | 10.84 |
| 44761.104166666664 | 11.75 |
| 44761.114583333336 | 15.64 |
| 44761.125 | 13.83 |
| 44761.135416666664 | 14.89 |
| 44761.145833333336 | 13.78 |
| 44761.15625 | 12.81 |
| 44761.166666666664 | 13.91 |
| 44761.177083333336 | 11.97 |
| 44761.1875 | 11.01 |
| 44761.197916666664 | 10.57 |
| 44761.208333333336 | 10.09 |
| 44761.21875 | 9.03 |
| 44761.229166666664 | 9.24 |
| 44761.239583333336 | 8.43 |
| 44761.25 | 8.31 |
| 44761.260416666664 | 9.12 |
| 44761.270833333336 | 8.42 |
| 44761.28125 | 7.89 |
| 44761.291666666664 | 7.95 |
| 44761.302083333336 | 7.57 |
| 44761.3125 | 8.56 |
| 44761.322916666664 | 8.16 |
| 44761.333333333336 | 8.04 |
| 44761.34375 | 7.63 |
| 44761.354166666664 | 8.34 |
| 44761.364583333336 | 7.65 |
| 44761.375 | 7.82 |
| 44761.385416666664 | 7.21 |
| 44761.395833333336 | 7.68 |
| 44761.40625 | 7.76 |
| 44761.416666666664 | 7.62 |
| 44761.427083333336 | 7.59 |
| 44761.4375 | 7.89 |
| 44761.447916666664 | 8.09 |
| 44761.458333333336 | 8.82 |
| 44761.46875 | 9.23 |
| 44761.479166666664 | 10.13 |
| 44761.489583333336 | 10.89 |
| 44761.5 | 10.8 |
| 44761.510416666664 | 11.75 |
| 44761.520833333336 | 10.74 |
| 44761.53125 | 8.62 |
| 44761.541666666664 | 7.55 |
| 44761.552083333336 | 7.36 |
| 44761.5625 | 6.95 |
| 44761.572916666664 | 6.47 |
| 44761.583333333336 | 6.09 |
| 44761.59375 | 6.08 |
| 44761.604166666664 | 6.25 |
| 44761.614583333336 | 6.37 |
| 44761.625 | 6.13 |
| 44761.635416666664 | 6.98 |
| 44761.645833333336 | 6.78 |
| 44761.65625 | 7.94 |
| 44761.666666666664 | 7.89 |
| 44761.677083333336 | 7.05 |
| 44761.6875 | 7.03 |
| 44761.697916666664 | 7.2 |
| 44761.708333333336 | 7.23 |
| 44761.71875 | 6.61 |
| 44761.729166666664 | 7.03 |
| 44761.739583333336 | 7.27 |
| 44761.75 | 7.49 |
| 44761.760416666664 | 6.69 |
| 44761.770833333336 | 7.18 |
| 44761.78125 | 6.36 |
| 44761.791666666664 | 7.96 |
| 44761.802083333336 | 9.69 |
| 44761.8125 | 8.16 |
| 44761.822916666664 | 7.58 |
| 44761.833333333336 | 9.26 |
| 44761.84375 | 10.52 |
| 44761.854166666664 | 9.68 |
| 44761.864583333336 | 10.24 |
| 44761.875 | 10.59 |
| 44761.885416666664 | 11.7 |
| 44761.895833333336 | 11.15 |
| 44761.90625 | 10.46 |
| 44761.916666666664 | 11.53 |
| 44761.927083333336 | 11.8 |
| 44761.9375 | 12.73 |
| 44761.947916666664 | 12.87 |
| 44761.958333333336 | 13.42 |
| 44761.96875 | 12.99 |
| 44761.979166666664 | 12.84 |
| 44761.989583333336 | 12.64 |
| 44762.0 | 13.22 |
| 44762.010416666664 | 13.51 |
| 44762.020833333336 | 14.96 |
| 44762.03125 | 16.37 |
| 44762.041666666664 | 13.83 |
| 44762.052083333336 | 14.25 |
| 44762.0625 | 11.91 |
| 44762.072916666664 | 12.03 |
| 44762.083333333336 | 11.17 |
| 44762.09375 | 11.11 |
| 44762.104166666664 | 10.49 |
| 44762.114583333336 | 9.89 |
| 44762.125 | 9.5 |
| 44762.135416666664 | 8.94 |
| 44762.145833333336 | 9.1 |
| 44762.15625 | 8.24 |
| 44762.166666666664 | 7.96 |
| 44762.177083333336 | 7.3 |
| 44762.1875 | 6.79 |
| 44762.197916666664 | 7.19 |
| 44762.208333333336 | 6.82 |
| 44762.21875 | 6.99 |
| 44762.229166666664 | 7.2 |
| 44762.239583333336 | 6.67 |
| 44762.25 | 6.98 |
| 44762.260416666664 | 6.95 |
| 44762.270833333336 | 6.95 |
| 44762.28125 | 7.99 |
| 44762.291666666664 | 5.89 |
| 44762.302083333336 | 6.44 |
| 44762.3125 | 6.97 |
| 44762.322916666664 | 5.92 |
| 44762.333333333336 | 6.13 |
| 44762.34375 | 5.6 |
| 44762.354166666664 | 5.24 |
| 44762.364583333336 | 5.67 |
| 44762.375 | 5.22 |
| 44762.385416666664 | 5.38 |
| 44762.395833333336 | 5.63 |
| 44762.40625 | 6.35 |
| 44762.416666666664 | 6.07 |
| 44762.427083333336 | 6.08 |
| 44762.4375 | 6.43 |
| 44762.447916666664 | 6.58 |
| 44762.458333333336 | 7.07 |
| 44762.46875 | 7.69 |
| 44762.479166666664 | 8.17 |
| 44762.489583333336 | 8.29 |
| 44762.5 | 9.55 |
| 44762.510416666664 | 10.48 |
| 44762.520833333336 | 11.23 |
| 44762.53125 | 12.71 |
| 44762.541666666664 | 12.34 |
| 44762.552083333336 | 11.1 |
| 44762.5625 | 9.46 |
| 44762.572916666664 | 7.39 |
| 44762.583333333336 | 6.68 |
| 44762.59375 | 7.81 |
| 44762.604166666664 | 7.01 |
| 44762.614583333336 | 6.5 |
| 44762.625 | 6.55 |
| 44762.635416666664 | 6.2 |
| 44762.645833333336 | 6.22 |
| 44762.65625 | 6.07 |
| 44762.666666666664 | 6.21 |
| 44762.677083333336 | 6.2 |
| 44762.6875 | 6.57 |
| 44762.697916666664 | 6.17 |
| 44762.708333333336 | 7.09 |
| 44762.71875 | 6.78 |
| 44762.729166666664 | 7.96 |
| 44762.739583333336 | 8.26 |
| 44762.75 | 8.12 |
| 44762.760416666664 | 7.98 |
| 44762.770833333336 | 8.92 |
| 44762.78125 | 8.51 |
| 44762.791666666664 | 9.4 |
| 44762.802083333336 | 10.7 |
| 44762.8125 | 11.03 |
| 44762.822916666664 | 9.06 |
| 44762.833333333336 | 11.47 |
| 44762.84375 | 11.34 |
| 44762.854166666664 | 11.96 |
| 44762.864583333336 | 11.14 |
| 44762.875 | 11.02 |
| 44762.885416666664 | 10.27 |
| 44762.895833333336 | 11.37 |
| 44762.90625 | 10.53 |
| 44762.916666666664 | 10.94 |
| 44762.927083333336 | 10.15 |
| 44762.9375 | 9.94 |
| 44762.947916666664 | 10.3 |
| 44762.958333333336 | 10.8 |
| 44762.96875 | 11.55 |
| 44762.979166666664 | 12.19 |
| 44762.989583333336 | 13.11 |
| 44763.0 | 13.19 |
| 44763.010416666664 | 13.43 |
| 44763.020833333336 | 14.02 |
| 44763.03125 | 14.14 |
| 44763.041666666664 | 14.32 |
| 44763.052083333336 | 14.98 |
| 44763.0625 | 15.58 |
| 44763.072916666664 | 14.48 |
| 44763.083333333336 | 12.8 |
| 44763.09375 | 11.95 |
| 44763.104166666664 | 12.34 |
| 44763.114583333336 | 11.28 |
| 44763.125 | 10.24 |
| 44763.135416666664 | 10.06 |
| 44763.145833333336 | 10.47 |
| 44763.15625 | 10.45 |
| 44763.166666666664 | 9.54 |
| 44763.177083333336 | 10.61 |
| 44763.1875 | 10.49 |
| 44763.197916666664 | 9.38 |
| 44763.208333333336 | 10.09 |
| 44763.21875 | 10.71 |
| 44763.229166666664 | 10.79 |
| 44763.239583333336 | 10.63 |
| 44763.25 | 10.55 |
| 44763.260416666664 | 10.99 |
| 44763.270833333336 | 10.58 |
| 44763.28125 | 10.03 |
| 44763.291666666664 | 9.82 |
| 44763.302083333336 | 10.43 |
| 44763.3125 | 10.26 |
| 44763.322916666664 | 7.91 |
| 44763.333333333336 | 7.7 |
| 44763.34375 | 8.81 |
| 44763.354166666664 | 8.24 |
| 44763.364583333336 | 8.59 |
| 44763.375 | 7.83 |
| 44763.385416666664 | 7.88 |
| 44763.395833333336 | 7.41 |
| 44763.40625 | 7.97 |
| 44763.416666666664 | 7.79 |
| 44763.427083333336 | 6.8 |
| 44763.4375 | 6.91 |
| 44763.447916666664 | 6.57 |
| 44763.458333333336 | 6.73 |
| 44763.46875 | 6.9 |
| 44763.479166666664 | 7.62 |
| 44763.489583333336 | 7.92 |
| 44763.5 | 8.57 |
| 44763.510416666664 | 9.87 |
| 44763.520833333336 | 10.41 |
| 44763.53125 | 11.46 |
| 44763.541666666664 | 12.43 |
| 44763.552083333336 | 13.54 |
| 44763.5625 | 14.09 |
| 44763.572916666664 | 12.98 |
| 44763.583333333336 | 12.01 |
| 44763.59375 | 10.36 |
| 44763.604166666664 | 8.1 |
| 44763.614583333336 | 7.86 |
| 44763.625 | 7.99 |
| 44763.635416666664 | 7.45 |
| 44763.645833333336 | 7.4 |
| 44763.65625 | 7.73 |
| 44763.666666666664 | 7.94 |
| 44763.677083333336 | 7.95 |
| 44763.6875 | 8.36 |
| 44763.697916666664 | 8.95 |
| 44763.708333333336 | 9.63 |
| 44763.71875 | 9.97 |
| 44763.729166666664 | 9.76 |
| 44763.739583333336 | 10.8 |
| 44763.75 | 10.05 |
| 44763.760416666664 | 10.24 |
| 44763.770833333336 | 10.57 |
| 44763.78125 | 11.63 |
| 44763.791666666664 | 10.9 |
| 44763.802083333336 | 11.65 |
| 44763.8125 | 11.18 |
| 44763.822916666664 | 11.57 |
| 44763.833333333336 | 11.33 |
| 44763.84375 | 9.81 |
| 44763.854166666664 | 10.89 |
| 44763.864583333336 | 11.6 |
| 44763.875 | 12.26 |
| 44763.885416666664 | 11.62 |
| 44763.895833333336 | 11.67 |
| 44763.90625 | 13.28 |
| 44763.916666666664 | 12.47 |
| 44763.927083333336 | 13.44 |
| 44763.9375 | 12.45 |
| 44763.947916666664 | 13.48 |
| 44763.958333333336 | 12.94 |
| 44763.96875 | 11.71 |
| 44763.979166666664 | 12.66 |
| 44763.989583333336 | 11.81 |
| 44764.0 | 12.52 |
| 44764.010416666664 | 14.05 |
| 44764.020833333336 | 15.42 |
| 44764.03125 | 14.5 |
| 44764.041666666664 | 15.17 |
| 44764.052083333336 | 14.58 |
| 44764.0625 | 14.98 |
| 44764.072916666664 | 15.5 |
| 44764.083333333336 | 14.7 |
| 44764.09375 | 14.82 |
| 44764.104166666664 | 14.36 |
| 44764.114583333336 | 14.23 |
| 44764.125 | 12.64 |
| 44764.135416666664 | 11.42 |
| 44764.145833333336 | 11.66 |
| 44764.15625 | 10.41 |
| 44764.166666666664 | 9.94 |
| 44764.177083333336 | 10.39 |
| 44764.1875 | 9.37 |
| 44764.197916666664 | 8.32 |
| 44764.208333333336 | 8.8 |
| 44764.21875 | 9.13 |
| 44764.229166666664 | 8.7 |
| 44764.239583333336 | 8.79 |
| 44764.25 | 8.65 |
| 44764.260416666664 | 7.89 |
| 44764.270833333336 | 7.91 |
| 44764.28125 | 7.38 |
| 44764.291666666664 | 7.24 |
| 44764.302083333336 | 7.02 |
| 44764.3125 | 6.96 |
| 44764.322916666664 | 6.54 |
| 44764.333333333336 | 6.73 |
| 44764.34375 | 6.63 |
| 44764.354166666664 | 6.36 |
| 44764.364583333336 | 6.11 |
| 44764.375 | 6.33 |
| 44764.385416666664 | 5.77 |
| 44764.395833333336 | 5.95 |
| 44764.40625 | 6.59 |
| 44764.416666666664 | 6.46 |
| 44764.427083333336 | 6.43 |
| 44764.4375 | 5.66 |
| 44764.447916666664 | 5.27 |
| 44764.458333333336 | 5.52 |
| 44764.46875 | 5.6 |
| 44764.479166666664 | 5.86 |
| 44764.489583333336 | 6.31 |
| 44764.5 | 6.53 |
| 44764.510416666664 | 6.94 |
| 44764.520833333336 | 7.62 |
| 44764.53125 | 8.48 |
| 44764.541666666664 | 9.42 |
| 44764.552083333336 | 9.83 |
| 44764.5625 | 10.37 |
| 44764.572916666664 | 11.73 |
| 44764.583333333336 | 13.03 |
| 44764.59375 | 11.82 |
| 44764.604166666664 | 16.81 |
| 44764.614583333336 | 13.69 |
| 44764.625 | 11.25 |
| 44764.635416666664 | 9.47 |
| 44764.645833333336 | 9.15 |
| 44764.65625 | 8.45 |
| 44764.666666666664 | 7.78 |
| 44764.677083333336 | 7.23 |
| 44764.6875 | 6.71 |
| 44764.697916666664 | 6.82 |
| 44764.708333333336 | 6.22 |
| 44764.71875 | 6.36 |
| 44764.729166666664 | 6.49 |
| 44764.739583333336 | 6.78 |
| 44764.75 | 7.3 |
| 44764.760416666664 | 7.59 |
| 44764.770833333336 | 7.62 |
| 44764.78125 | 8.2 |
| 44764.791666666664 | 8.39 |
| 44764.802083333336 | 8.67 |
| 44764.8125 | 8.43 |
| 44764.822916666664 | 8.41 |
| 44764.833333333336 | 8.74 |
| 44764.84375 | 8.5 |
| 44764.854166666664 | 8.77 |
| 44764.864583333336 | 7.96 |
| 44764.875 | 8.79 |
| 44764.885416666664 | 8.42 |
| 44764.895833333336 | 8.32 |
| 44764.90625 | 9.41 |
| 44764.916666666664 | 8.81 |
| 44764.927083333336 | 9.94 |
| 44764.9375 | 11.05 |
| 44764.947916666664 | 12.55 |
| 44764.958333333336 | 12.66 |
| 44764.96875 | 13.4 |
| 44764.979166666664 | 13.56 |
| 44764.989583333336 | 13.58 |
| 44765.0 | 12.66 |
| 44765.010416666664 | 13.48 |
| 44765.020833333336 | 15.07 |
| 44765.03125 | 14.51 |
| 44765.041666666664 | 13.66 |
| 44765.052083333336 | 15.05 |
| 44765.0625 | 15.41 |
| 44765.072916666664 | 14.87 |
| 44765.083333333336 | 14.62 |
| 44765.09375 | 14.84 |
| 44765.104166666664 | 14.89 |
| 44765.114583333336 | 14.77 |
| 44765.125 | 15.33 |
| 44765.135416666664 | 15.57 |
| 44765.145833333336 | 13.15 |
| 44765.15625 | 12.61 |
| 44765.166666666664 | 12.69 |
| 44765.177083333336 | 11.61 |
| 44765.1875 | 11.06 |
| 44765.197916666664 | 10.25 |
| 44765.208333333336 | 10.43 |
| 44765.21875 | 10.27 |
| 44765.229166666664 | 9.97 |
| 44765.239583333336 | 9.25 |
| 44765.25 | 8.7 |
| 44765.260416666664 | 8.81 |
| 44765.270833333336 | 8.04 |
| 44765.28125 | 7.57 |
| 44765.291666666664 | 7.73 |
| 44765.302083333336 | 7.3 |
| 44765.3125 | 7.14 |
| 44765.322916666664 | 7.27 |
| 44765.333333333336 | 6.75 |
| 44765.34375 | 7.73 |
| 44765.354166666664 | 6.28 |
| 44765.364583333336 | 6.74 |
| 44765.375 | 6.6 |
| 44765.385416666664 | 6.29 |
| 44765.395833333336 | 5.7 |
| 44765.40625 | 5.96 |
| 44765.416666666664 | 6.19 |
| 44765.427083333336 | 5.6 |
| 44765.4375 | 5.69 |
| 44765.447916666664 | 5.07 |
| 44765.458333333336 | 4.93 |
| 44765.46875 | 4.84 |
| 44765.479166666664 | 4.99 |
| 44765.489583333336 | 5.46 |
| 44765.5 | 5.37 |
| 44765.510416666664 | 6.1 |
| 44765.520833333336 | 6.25 |
| 44765.53125 | 7.07 |
| 44765.541666666664 | 7.78 |
| 44765.552083333336 | 7.03 |
| 44765.5625 | 9.52 |
| 44765.572916666664 | 11.2 |
| 44765.583333333336 | 10.94 |
| 44765.59375 | 10.41 |
| 44765.604166666664 | 13.85 |
| 44765.614583333336 | 15.17 |
| 44765.625 | 16.46 |
| 44765.635416666664 | 11.95 |
| 44765.645833333336 | 29.96 |
| 44765.65625 | 19.94 |
| 44765.666666666664 | 16.42 |
| 44765.677083333336 | 13.26 |
| 44765.6875 | 12.77 |
| 44765.697916666664 | 11.78 |
| 44765.708333333336 | 11.9 |
| 44765.71875 | 8.82 |
| 44765.729166666664 | 8.41 |
| 44765.739583333336 | 7.77 |
| 44765.75 | 7.79 |
| 44765.760416666664 | 7.93 |
| 44765.770833333336 | 7.52 |
| 44765.78125 | 7.73 |
| 44765.791666666664 | 7.56 |
| 44765.802083333336 | 8.42 |
| 44765.8125 | 9.06 |
| 44765.822916666664 | 9.3 |
| 44765.833333333336 | 10.23 |
| 44765.84375 | 11.03 |
| 44765.854166666664 | 11.25 |
| 44765.864583333336 | 11.81 |
| 44765.875 | 12.67 |
| 44765.885416666664 | 11.55 |
| 44765.895833333336 | 11.5 |
| 44765.90625 | 11.42 |
| 44765.916666666664 | 11.32 |
| 44765.927083333336 | 10.65 |
| 44765.9375 | 9.5 |
| 44765.947916666664 | 9.75 |
| 44765.958333333336 | 12.65 |
| 44765.96875 | 14.21 |
| 44765.979166666664 | 15.65 |
| 44765.989583333336 | 14.7 |
| 44766.0 | 15.74 |
| 44766.010416666664 | 15.31 |
| 44766.020833333336 | 15.92 |
| 44766.03125 | 16.47 |
| 44766.041666666664 | 14.94 |
| 44766.052083333336 | 13.84 |
| 44766.0625 | 13.32 |
| 44766.072916666664 | 12.53 |
| 44766.083333333336 | 12.97 |
| 44766.09375 | 12.57 |
| 44766.104166666664 | 12.84 |
| 44766.114583333336 | 12.65 |
| 44766.125 | 12.32 |
| 44766.135416666664 | 12.14 |
| 44766.145833333336 | 11.08 |
| 44766.15625 | 11.28 |
| 44766.166666666664 | 11.75 |
| 44766.177083333336 | 11.57 |
| 44766.1875 | 10.47 |
| 44766.197916666664 | 9.45 |
| 44766.208333333336 | 9.97 |
| 44766.21875 | 8.94 |
| 44766.229166666664 | 8.65 |
| 44766.239583333336 | 8.05 |
| 44766.25 | 8.2 |
| 44766.260416666664 | 8.03 |
| 44766.270833333336 | 7.64 |
| 44766.28125 | 7.49 |
| 44766.291666666664 | 6.94 |
| 44766.302083333336 | 6.96 |
| 44766.3125 | 6.64 |
| 44766.322916666664 | 6.81 |
| 44766.333333333336 | 6.11 |
| 44766.34375 | 5.9 |
| 44766.354166666664 | 5.93 |
| 44766.364583333336 | 5.68 |
| 44766.375 | 5.56 |
| 44766.385416666664 | 5.36 |
| 44766.395833333336 | 5.27 |
| 44766.40625 | 5.75 |
| 44766.416666666664 | 5.85 |
| 44766.427083333336 | 4.5 |
| 44766.4375 | 5.7 |
| 44766.447916666664 | 4.84 |
| 44766.458333333336 | 4.95 |
| 44766.46875 | 4.06 |
| 44766.479166666664 | 4.06 |
| 44766.489583333336 | 4.5 |
| 44766.5 | 4.7 |
| 44766.510416666664 | 4.48 |
| 44766.520833333336 | 4.67 |
| 44766.53125 | 4.89 |
| 44766.541666666664 | 5.12 |
| 44766.552083333336 | 5.58 |
| 44766.5625 | 6.05 |
| 44766.572916666664 | 7.21 |
| 44766.583333333336 | 7.68 |
| 44766.59375 | 9.36 |
| 44766.604166666664 | 10.16 |
| 44766.614583333336 | 12.49 |
| 44766.625 | 13.71 |
| 44766.635416666664 | 14.47 |
| 44766.645833333336 | 16.3 |
| 44766.65625 | 17.74 |
| 44766.666666666664 | 18.56 |
| 44766.677083333336 | 20.74 |
| 44766.6875 | 26.38 |
| 44766.697916666664 | 21.67 |
| 44766.708333333336 | 19.03 |
| 44766.71875 | 16.12 |
| 44766.729166666664 | 13.46 |
| 44766.739583333336 | 9.59 |
| 44766.75 | 7.84 |
| 44766.760416666664 | 7.48 |
| 44766.770833333336 | 8.49 |
| 44766.78125 | 8.75 |
| 44766.791666666664 | 9.21 |
| 44766.802083333336 | 10.66 |
| 44766.8125 | 11.07 |
| 44766.822916666664 | 10.73 |
| 44766.833333333336 | 11.11 |
| 44766.84375 | 11.94 |
| 44766.854166666664 | 11.42 |
| 44766.864583333336 | 11.34 |
| 44766.875 | 11.23 |
| 44766.885416666664 | 10.64 |
| 44766.895833333336 | 10.78 |
| 44766.90625 | 10.49 |
| 44766.916666666664 | 10.85 |
| 44766.927083333336 | 10.76 |
| 44766.9375 | 10.87 |
| 44766.947916666664 | 10.72 |
| 44766.958333333336 | 10.55 |
| 44766.96875 | 8.77 |
| 44766.979166666664 | 9.93 |
| 44766.989583333336 | 10.65 |
| 44767.0 | 9.67 |
| 44767.010416666664 | 10.4 |
| 44767.020833333336 | 10.16 |
| 44767.03125 | 11.8 |
| 44767.041666666664 | 10.83 |
| 44767.052083333336 | 10.73 |
| 44767.0625 | 9.92 |
| 44767.072916666664 | 9.96 |
| 44767.083333333336 | 9.98 |
| 44767.09375 | 10.41 |
| 44767.104166666664 | 10.47 |
| 44767.114583333336 | 11.38 |
| 44767.125 | 10.84 |
| 44767.135416666664 | 10.64 |
| 44767.145833333336 | 11.02 |
| 44767.15625 | 10.95 |
| 44767.166666666664 | 10.69 |
| 44767.177083333336 | 10.97 |
| 44767.1875 | 10.67 |
| 44767.197916666664 | 10.16 |
| 44767.208333333336 | 10.43 |
| 44767.21875 | 9.95 |
| 44767.229166666664 | 9.28 |
| 44767.239583333336 | 9.23 |
| 44767.25 | 8.69 |
| 44767.260416666664 | 8.99 |
| 44767.270833333336 | 8.26 |
| 44767.28125 | 7.89 |
| 44767.291666666664 | 8.03 |
| 44767.302083333336 | 7.81 |
| 44767.3125 | 8.44 |
| 44767.322916666664 | 8.02 |
| 44767.333333333336 | 8.2 |
| 44767.34375 | 8.66 |
| 44767.354166666664 | 9.13 |
| 44767.364583333336 | 8.78 |
| 44767.375 | 9.92 |
| 44767.385416666664 | 9.24 |
| 44767.395833333336 | 9.44 |
| 44767.40625 | 9.53 |
| 44767.416666666664 | 9.34 |
| 44767.427083333336 | 8.98 |
| 44767.4375 | 8 |
| 44767.447916666664 | 8.72 |
| 44767.458333333336 | 6.62 |
| 44767.46875 | 6.42 |
| 44767.479166666664 | 6.92 |
| 44767.489583333336 | 6.22 |
| 44767.5 | 8.2 |
| 44767.510416666664 | 8.32 |
| 44767.520833333336 | 8.38 |
| 44767.53125 | 8.67 |
| 44767.541666666664 | 8.61 |
| 44767.552083333336 | 9.23 |
| 44767.5625 | 8.74 |
| 44767.572916666664 | 9.06 |
| 44767.583333333336 | 8.96 |
| 44767.59375 | 9.44 |
| 44767.604166666664 | 9.14 |
| 44767.614583333336 | 9.21 |
| 44767.625 | 10.39 |
| 44767.635416666664 | 11.03 |
| 44767.645833333336 | 12.21 |
| 44767.65625 | 12.05 |
| 44767.666666666664 | 12.36 |
| 44767.677083333336 | 13.94 |
| 44767.6875 | 13.93 |
| 44767.697916666664 | 13.32 |
| 44767.708333333336 | 13.12 |
| 44767.71875 | 13.5 |
| 44767.729166666664 | 14.89 |
| 44767.739583333336 | 12.71 |
| 44767.75 | 12.05 |
| 44767.760416666664 | 10.34 |
| 44767.770833333336 | 9.25 |
| 44767.78125 | 9.09 |
| 44767.791666666664 | 9.47 |
| 44767.802083333336 | 9.66 |
| 44767.8125 | 10.15 |
| 44767.822916666664 | 10.3 |
| 44767.833333333336 | 9.83 |
| 44767.84375 | 9.28 |
| 44767.854166666664 | 9.1 |
| 44767.864583333336 | 9.05 |
| 44767.875 | 9.08 |
| 44767.885416666664 | 9.34 |
| 44767.895833333336 | 9.3 |
| 44767.90625 | 9.41 |
| 44767.916666666664 | 9.36 |
| 44767.927083333336 | 9.09 |
| 44767.9375 | 8.95 |
| 44767.947916666664 | 8.85 |
| 44767.958333333336 | 8.56 |
| 44767.96875 | 7.97 |
| 44767.979166666664 | 7.99 |
| 44767.989583333336 | 7.56 |
| 44768.0 | 8.91 |
| 44768.010416666664 | 7.93 |
| 44768.020833333336 | 7.57 |
| 44768.03125 | 7.5 |
| 44768.041666666664 | 7.05 |
| 44768.052083333336 | 6.98 |
| 44768.0625 | 7.27 |
| 44768.072916666664 | 6.83 |
| 44768.083333333336 | 7.22 |
| 44768.09375 | 7.72 |
| 44768.104166666664 | 7.72 |
| 44768.114583333336 | 8.73 |
| 44768.125 | 8.63 |
| 44768.135416666664 | 8.35 |
| 44768.145833333336 | 8.42 |
| 44768.15625 | 8.3 |
| 44768.166666666664 | 8.14 |
| 44768.177083333336 | 8.21 |
| 44768.1875 | 8.67 |
| 44768.197916666664 | 8.27 |
| 44768.208333333336 | 8.28 |
| 44768.21875 | 8.51 |
| 44768.229166666664 | 9.06 |
| 44768.239583333336 | 8.3 |
| 44768.25 | 8.53 |
| 44768.260416666664 | 6.88 |
| 44768.270833333336 | 7.67 |
| 44768.28125 | 6.75 |
| 44768.291666666664 | 6.35 |
| 44768.302083333336 | 6.08 |
| 44768.3125 | 5.67 |
| 44768.322916666664 | 5.62 |
| 44768.333333333336 | 5.47 |
| 44768.34375 | 5.22 |
| 44768.354166666664 | 5.5 |
| 44768.364583333336 | 4.84 |
| 44768.375 | 5.25 |
| 44768.385416666664 | 4.75 |
| 44768.395833333336 | 5 |
| 44768.40625 | 5.05 |
| 44768.416666666664 | 5.13 |
| 44768.427083333336 | 4.86 |
| 44768.4375 | 5.13 |
| 44768.447916666664 | 4.38 |
| 44768.458333333336 | 4.58 |
| 44768.46875 | 4.25 |
| 44768.479166666664 | 4.38 |
| 44768.489583333336 | 3.68 |
| 44768.5 | 4.22 |
| 44768.510416666664 | 4.15 |
| 44768.520833333336 | 4.19 |
| 44768.53125 | 4.47 |
| 44768.541666666664 | 4.03 |
| 44768.552083333336 | 5.02 |
| 44768.5625 | 4.22 |
| 44768.572916666664 | 4.57 |
| 44768.583333333336 | 4.9 |
| 44768.59375 | 5.1 |
| 44768.604166666664 | 4.16 |
| 44768.614583333336 | 5.5 |
| 44768.625 | 5.56 |
| 44768.635416666664 | 5.79 |
| 44768.645833333336 | 6.43 |
| 44768.65625 | 6.96 |
| 44768.666666666664 | 7.97 |
| 44768.677083333336 | 7.35 |
| 44768.6875 | 9.39 |
| 44768.697916666664 | 12.47 |
| 44768.708333333336 | 15.58 |
| 44768.71875 | 17.7 |
| 44768.729166666664 | 19.39 |
| 44768.739583333336 | 13.39 |
| 44768.75 | 12.17 |
| 44768.760416666664 | 11.18 |
| 44768.770833333336 | 10.18 |
| 44768.78125 | 9.22 |
| 44768.791666666664 | 7.78 |
| 44768.802083333336 | 7.09 |
| 44768.8125 | 7.42 |
| 44768.822916666664 | 6.56 |
| 44768.833333333336 | 6.32 |
| 44768.84375 | 6.04 |
| 44768.854166666664 | 6.07 |
| 44768.864583333336 | 6.26 |
| 44768.875 | 6.49 |
| 44768.885416666664 | 7.01 |
| 44768.895833333336 | 7.38 |
| 44768.90625 | 7.42 |
| 44768.916666666664 | 7.95 |
| 44768.927083333336 | 7.4 |
| 44768.9375 | 6.48 |
| 44768.947916666664 | 6.96 |
| 44768.958333333336 | 5.98 |
| 44768.96875 | 5.92 |
| 44768.979166666664 | 6.03 |
| 44768.989583333336 | 7.06 |
| 44769.0 | 6.25 |
| 44769.010416666664 | 6.53 |
| 44769.020833333336 | 6.66 |
| 44769.03125 | 6.17 |
| 44769.041666666664 | 5.4 |
| 44769.052083333336 | 5.69 |
| 44769.0625 | 5.65 |
| 44769.072916666664 | 5.52 |
| 44769.083333333336 | 8.6 |
| 44769.09375 | 5.27 |
| 44769.104166666664 | 5.43 |
| 44769.114583333336 | 5.27 |
| 44769.125 | 4.78 |
| 44769.135416666664 | 4.93 |
| 44769.145833333336 | 5.13 |
| 44769.15625 | 5.19 |
| 44769.166666666664 | 5.11 |
| 44769.177083333336 | 5.11 |
| 44769.1875 | 5.01 |
| 44769.197916666664 | 5.33 |
| 44769.208333333336 | 5.31 |
| 44769.21875 | 5.6 |
| 44769.229166666664 | 5.19 |
| 44769.239583333336 | 5.69 |
| 44769.25 | 5.73 |
| 44769.260416666664 | 5.76 |
| 44769.270833333336 | 4.36 |
| 44769.28125 | 4.64 |
| 44769.291666666664 | 4.21 |
| 44769.302083333336 | 4.41 |
| 44769.3125 | 4.32 |
| 44769.322916666664 | 4.29 |
| 44769.333333333336 | 4.32 |
| 44769.34375 | 4.11 |
| 44769.354166666664 | 4.06 |
| 44769.364583333336 | 3.62 |
| 44769.375 | 3.81 |
| 44769.385416666664 | 3.61 |
| 44769.395833333336 | 3.55 |
| 44769.40625 | 3.77 |
| 44769.416666666664 | 3.79 |
| 44769.427083333336 | 3.77 |
| 44769.4375 | 3.85 |
| 44769.447916666664 | 3.78 |
| 44769.458333333336 | 3.4 |
| 44769.46875 | 3.26 |
| 44769.479166666664 | 3.21 |
| 44769.489583333336 | 3.22 |
| 44769.5 | 3.11 |
| 44769.510416666664 | 2.98 |
| 44769.520833333336 | 3.06 |
| 44769.53125 | 2.5 |
| 44769.541666666664 | 2.72 |
| 44769.552083333336 | 2.97 |
| 44769.5625 | 2.72 |
| 44769.572916666664 | 2.85 |
| 44769.583333333336 | 2.83 |
| 44769.59375 | 2.8 |
| 44769.604166666664 | 3.23 |
| 44769.614583333336 | 3.08 |
| 44769.625 | 2.9 |
| 44769.635416666664 | 2.93 |
| 44769.645833333336 | 3.35 |
| 44769.65625 | 4.3 |
| 44769.666666666664 | 3.63 |
| 44769.677083333336 | 3.98 |
| 44769.6875 | 4.24 |
| 44769.697916666664 | 4.82 |
| 44769.708333333336 | 5.47 |
| 44769.71875 | 7.17 |
| 44769.729166666664 | 9.14 |
| 44769.739583333336 | 9.13 |
| 44769.75 | 10.15 |
| 44769.760416666664 | 13.13 |
| 44769.770833333336 | 14.11 |
| 44769.78125 | 12.6 |
| 44769.791666666664 | 11.14 |
| 44769.802083333336 | 12.18 |
| 44769.8125 | 11.75 |
| 44769.822916666664 | 11.75 |
| 44769.833333333336 | 9.24 |
| 44769.84375 | 7.93 |
| 44769.854166666664 | 7.05 |
| 44769.864583333336 | 6.24 |
| 44769.875 | 5.93 |
| 44769.885416666664 | 5.58 |
| 44769.895833333336 | 5.64 |
| 44769.90625 | 5.72 |
| 44769.916666666664 | 5.59 |
| 44769.927083333336 | 5.8 |
| 44769.9375 | 6.16 |
| 44769.947916666664 | 6.01 |
| 44769.958333333336 | 6.68 |
| 44769.96875 | 6.59 |
| 44769.979166666664 | 6.94 |
| 44769.989583333336 | 7.21 |
| 44770.0 | 7.93 |
| 44770.010416666664 | 7.31 |
| 44770.020833333336 | 8.74 |
| 44770.03125 | 7.52 |
| 44770.041666666664 | 6.38 |
| 44770.052083333336 | 7.11 |
| 44770.0625 | 6.94 |
| 44770.072916666664 | 6.82 |
| 44770.083333333336 | 6.19 |
| 44770.09375 | 6.56 |
| 44770.104166666664 | 6.1 |
| 44770.114583333336 | 5.72 |
| 44770.125 | 6.46 |
| 44770.135416666664 | 5.3 |
| 44770.145833333336 | 5 |
| 44770.15625 | 5.35 |
| 44770.166666666664 | 5.05 |
| 44770.177083333336 | 5.06 |
| 44770.1875 | 5.02 |
| 44770.197916666664 | 5.21 |
| 44770.208333333336 | 5.39 |
| 44770.21875 | 5.57 |
| 44770.229166666664 | 5.08 |
| 44770.239583333336 | 5.74 |
| 44770.25 | 6.12 |
| 44770.260416666664 | 6.42 |
| 44770.270833333336 | 6.33 |
| 44770.28125 | 6.71 |
| 44770.291666666664 | 6.16 |
| 44770.302083333336 | 6.16 |
| 44770.3125 | 5.93 |
| 44770.322916666664 | 5.36 |
| 44770.333333333336 | 4.79 |
| 44770.34375 | 5.07 |
| 44770.354166666664 | 4.6 |
| 44770.364583333336 | 5.03 |
| 44770.375 | 4.56 |
| 44770.385416666664 | 4.31 |
| 44770.395833333336 | 4.02 |
| 44770.40625 | 3.76 |
| 44770.416666666664 | 3.95 |
| 44770.427083333336 | 3.44 |
| 44770.4375 | 3.31 |
| 44770.447916666664 | 3.3 |
| 44770.458333333336 | 3.25 |
| 44770.46875 | 3.27 |
| 44770.479166666664 | 3.2 |
| 44770.489583333336 | 3.27 |
| 44770.5 | 3.29 |
| 44770.510416666664 | 3.4 |
| 44770.520833333336 | 3.24 |
| 44770.53125 | 3.19 |
| 44770.541666666664 | 3.13 |
| 44770.552083333336 | 3.31 |
| 44770.5625 | 3.24 |
| 44770.572916666664 | 3.01 |
| 44770.583333333336 | 2.98 |
| 44770.59375 | 3.28 |
| 44770.604166666664 | 2.94 |
| 44770.614583333336 | 3.2 |
| 44770.625 | 3.39 |
| 44770.635416666664 | 3.63 |
| 44770.645833333336 | 3.62 |
| 44770.65625 | 3.31 |
| 44770.666666666664 | 3.62 |
| 44770.677083333336 | 4.05 |
| 44770.6875 | 3.6 |
| 44770.697916666664 | 4.32 |
| 44770.708333333336 | 4.96 |
| 44770.71875 | 7.98 |
| 44770.729166666664 | 9.48 |
| 44770.739583333336 | 12.34 |
| 44770.75 | 13.97 |
| 44770.760416666664 | 16.49 |
| 44770.770833333336 | 21.03 |
| 44770.78125 | 23.08 |
| 44770.791666666664 | 20.97 |
| 44770.802083333336 | 22.87 |
| 44770.8125 | 26.03 |
| 44770.822916666664 | 22.64 |
| 44770.833333333336 | 25.19 |
| 44770.84375 | 22.79 |
| 44770.854166666664 | 21.38 |
| 44770.864583333336 | 18.46 |
| 44770.875 | 13.79 |
| 44770.885416666664 | 11.26 |
| 44770.895833333336 | 9.76 |
| 44770.90625 | 8.8 |
| 44770.916666666664 | 8.56 |
| 44770.927083333336 | 8.15 |
| 44770.9375 | 8.19 |
| 44770.947916666664 | 8.36 |
| 44770.958333333336 | 8.75 |
| 44770.96875 | 8.92 |
| 44770.979166666664 | 9.88 |
| 44770.989583333336 | 10.84 |
| 44771.0 | 10.88 |
| 44771.010416666664 | 10.69 |
| 44771.020833333336 | 10.37 |
| 44771.03125 | 10.52 |
| 44771.041666666664 | 10.22 |
| 44771.052083333336 | 10.74 |
| 44771.0625 | 9.9 |
| 44771.072916666664 | 9.91 |
| 44771.083333333336 | 9.93 |
| 44771.09375 | 9.25 |
| 44771.104166666664 | 10.05 |
| 44771.114583333336 | 9.11 |
| 44771.125 | 9.12 |
| 44771.135416666664 | 9.63 |
| 44771.145833333336 | 8.97 |
| 44771.15625 | 9.9 |
| 44771.166666666664 | 9.73 |
| 44771.177083333336 | 8.54 |
| 44771.1875 | 7.34 |
| 44771.197916666664 | 6.78 |
| 44771.208333333336 | 7.18 |
| 44771.21875 | 6.82 |
| 44771.229166666664 | 6.5 |
| 44771.239583333336 | 6.47 |
| 44771.25 | 6.53 |
| 44771.260416666664 | 6.82 |
| 44771.270833333336 | 7.08 |
| 44771.28125 | 6.84 |
| 44771.291666666664 | 6.78 |
| 44771.302083333336 | 6.99 |
| 44771.3125 | 6.64 |
| 44771.322916666664 | 7.02 |
| 44771.333333333336 | 6.59 |
| 44771.34375 | 5.54 |
| 44771.354166666664 | 5.33 |
| 44771.364583333336 | 5.14 |
| 44771.375 | 5.71 |
| 44771.385416666664 | 4.9 |
| 44771.395833333336 | 4.72 |
| 44771.40625 | 4.7 |
| 44771.416666666664 | 4.49 |
| 44771.427083333336 | 4.52 |
| 44771.4375 | 4.07 |
| 44771.447916666664 | 4.02 |
| 44771.458333333336 | 3.74 |
| 44771.46875 | 3.88 |
| 44771.479166666664 | 3.92 |
| 44771.489583333336 | 3.85 |
| 44771.5 | 3.65 |
| 44771.510416666664 | 3.67 |
| 44771.520833333336 | 3.7 |
| 44771.53125 | 3.87 |
| 44771.541666666664 | 3.94 |
| 44771.552083333336 | 3.81 |
| 44771.5625 | 4 |
| 44771.572916666664 | 3.83 |
| 44771.583333333336 | 3.68 |
| 44771.59375 | 3.41 |
| 44771.604166666664 | 3.78 |
| 44771.614583333336 | 3.77 |
| 44771.625 | 3.39 |
| 44771.635416666664 | 4.16 |
| 44771.645833333336 | 4.15 |
| 44771.65625 | 4.1 |
| 44771.666666666664 | 3.82 |
| 44771.677083333336 | 3.88 |
| 44771.6875 | 3.97 |
| 44771.697916666664 | 4.36 |
| 44771.708333333336 | 4.71 |
| 44771.71875 | 5.96 |
| 44771.729166666664 | 7 |
| 44771.739583333336 | 9.98 |
| 44771.75 | 12.02 |
| 44771.760416666664 | 14.04 |
| 44771.770833333336 | 16.86 |
| 44771.78125 | 19.44 |
| 44771.791666666664 | 20.64 |
| 44771.802083333336 | 26.17 |
| 44771.8125 | 27.57 |
| 44771.822916666664 | 27.97 |
| 44771.833333333336 | 26.4 |
| 44771.84375 | 25.97 |
| 44771.854166666664 | 25.69 |
| 44771.864583333336 | 24.2 |
| 44771.875 | 20.26 |
| 44771.885416666664 | 16.01 |
| 44771.895833333336 | 13.75 |
| 44771.90625 | 11.77 |
| 44771.916666666664 | 10.71 |
| 44771.927083333336 | 9.84 |
| 44771.9375 | 9.3 |
| 44771.947916666664 | 8.64 |
| 44771.958333333336 | 8.18 |
| 44771.96875 | 8.31 |
| 44771.979166666664 | 8 |
| 44771.989583333336 | 7.76 |
| 44772.0 | 8.08 |
| 44772.010416666664 | 8.76 |
| 44772.020833333336 | 9.16 |
| 44772.03125 | 9.03 |
| 44772.041666666664 | 9.14 |
| 44772.052083333336 | 8.32 |
| 44772.0625 | 7.69 |
| 44772.072916666664 | 8.03 |
| 44772.083333333336 | 7.34 |
| 44772.09375 | 7.52 |
| 44772.104166666664 | 6.46 |
| 44772.114583333336 | 7.25 |
| 44772.125 | 6.56 |
| 44772.135416666664 | 5.87 |
| 44772.145833333336 | 6.52 |
| 44772.15625 | 6.06 |
| 44772.166666666664 | 5.95 |
| 44772.177083333336 | 5.62 |
| 44772.1875 | 5.53 |
| 44772.197916666664 | 5.32 |
| 44772.208333333336 | 5.51 |
| 44772.21875 | 4.81 |
| 44772.229166666664 | 4.98 |
| 44772.239583333336 | 4.48 |
| 44772.25 | 4.54 |
| 44772.260416666664 | 4.91 |
| 44772.270833333336 | 4.77 |
| 44772.28125 | 4.97 |
| 44772.291666666664 | 5.03 |
| 44772.302083333336 | 5.07 |
| 44772.3125 | 5.02 |
| 44772.322916666664 | 5.04 |
| 44772.333333333336 | 5.09 |
| 44772.34375 | 5.46 |
| 44772.354166666664 | 5.61 |
| 44772.364583333336 | 5.61 |
| 44772.375 | 4.55 |
| 44772.385416666664 | 4.57 |
| 44772.395833333336 | 4.86 |
| 44772.40625 | 4.51 |
| 44772.416666666664 | 4.55 |
| 44772.427083333336 | 4.17 |
| 44772.4375 | 4.3 |
| 44772.447916666664 | 3.9 |
| 44772.458333333336 | 3.84 |
| 44772.46875 | 3.73 |
| 44772.479166666664 | 3.76 |
| 44772.489583333336 | 3.32 |
| 44772.5 | 3.3 |
| 44772.510416666664 | 3.22 |
| 44772.520833333336 | 3.32 |
| 44772.53125 | 3.3 |
| 44772.541666666664 | 3.38 |
| 44772.552083333336 | 3.25 |
| 44772.5625 | 3.1 |
| 44772.572916666664 | 3.1 |
| 44772.583333333336 | 3.58 |
| 44772.59375 | 3.18 |
| 44772.604166666664 | 3.36 |
| 44772.614583333336 | 3.14 |
| 44772.625 | 2.87 |
| 44772.635416666664 | 3.54 |
| 44772.645833333336 | 4.22 |
| 44772.65625 | 3.55 |
| 44772.666666666664 | 4.18 |
| 44772.677083333336 | 4.09 |
| 44772.6875 | 4.22 |
| 44772.697916666664 | 4 |
| 44772.708333333336 | 4.07 |
| 44772.71875 | 4.12 |
| 44772.729166666664 | 4.25 |
| 44772.739583333336 | 5.13 |
| 44772.75 | 6.72 |
| 44772.760416666664 | 6.78 |
| 44772.770833333336 | 8.78 |
| 44772.78125 | 9.24 |
| 44772.791666666664 | 9.93 |
| 44772.802083333336 | 12.74 |
| 44772.8125 | 13.98 |
| 44772.822916666664 | 16.76 |
| 44772.833333333336 | 21.78 |
| 44772.84375 | 24.55 |
| 44772.854166666664 | 25.26 |
| 44772.864583333336 | 27.94 |
| 44772.875 | 20.62 |
| 44772.885416666664 | 19.08 |
| 44772.895833333336 | 18.07 |
| 44772.90625 | 15.37 |
| 44772.916666666664 | 14.72 |
| 44772.927083333336 | 11.93 |
| 44772.9375 | 10.56 |
| 44772.947916666664 | 9.33 |
| 44772.958333333336 | 8.35 |
| 44772.96875 | 7.63 |
| 44772.979166666664 | 6.89 |
| 44772.989583333336 | 7.23 |
| 44773.0 | 8.4 |
| 44773.010416666664 | 7.83 |
| 44773.020833333336 | 8.47 |
| 44773.03125 | 8.31 |
| 44773.041666666664 | 8.88 |
| 44773.052083333336 | 8.89 |
| 44773.0625 | 8.81 |
| 44773.072916666664 | 8.68 |
| 44773.083333333336 | 8.42 |
| 44773.09375 | 8.05 |
| 44773.104166666664 | 7.94 |
| 44773.114583333336 | 7.74 |
| 44773.125 | 7.97 |
| 44773.135416666664 | 7.24 |
| 44773.145833333336 | 7.14 |
| 44773.15625 | 7.74 |
| 44773.166666666664 | 7.39 |
| 44773.177083333336 | 7.13 |
| 44773.1875 | 6.88 |
| 44773.197916666664 | 6.69 |
| 44773.208333333336 | 6.03 |
| 44773.21875 | 6.27 |
| 44773.229166666664 | 5.73 |
| 44773.239583333336 | 5.67 |
| 44773.25 | 5.54 |
| 44773.260416666664 | 5.63 |
| 44773.270833333336 | 6.04 |
| 44773.28125 | 6.01 |
| 44773.291666666664 | 6.69 |
| 44773.302083333336 | 7 |
| 44773.3125 | 6.91 |
| 44773.322916666664 | 6.94 |
| 44773.333333333336 | 7.39 |
| 44773.34375 | 7.62 |
| 44773.354166666664 | 7.76 |
| 44773.364583333336 | 7.08 |
| 44773.375 | 6.98 |
| 44773.385416666664 | 7.46 |
| 44773.395833333336 | 6.38 |
| 44773.40625 | 6 |
| 44773.416666666664 | 6.2 |
| 44773.427083333336 | 6.44 |
| 44773.4375 | 6.1 |
| 44773.447916666664 | 5.67 |
| 44773.458333333336 | 5.26 |
| 44773.46875 | 5.33 |
| 44773.479166666664 | 4.99 |
| 44773.489583333336 | 4.63 |
| 44773.5 | 4.59 |
| 44773.510416666664 | 4.47 |
| 44773.520833333336 | 4.25 |
| 44773.53125 | 4.34 |
| 44773.541666666664 | 4.18 |
| 44773.552083333336 | 4.3 |
| 44773.5625 | 4.69 |
| 44773.572916666664 | 4.75 |
| 44773.583333333336 | 4.91 |
| 44773.59375 | 4.32 |
| 44773.604166666664 | 4.45 |
| 44773.614583333336 | 4.41 |
| 44773.625 | 4.49 |
| 44773.635416666664 | 4.81 |
| 44773.645833333336 | 4.42 |
| 44773.65625 | 5.09 |
| 44773.666666666664 | 5.64 |
| 44773.677083333336 | 5 |
| 44773.6875 | 4.73 |
| 44773.697916666664 | 4.53 |
| 44773.708333333336 | 4.57 |
| 44773.71875 | 4.72 |
| 44773.729166666664 | 4.88 |
| 44773.739583333336 | 4.75 |
| 44773.75 | 5.68 |
| 44773.760416666664 | 6.52 |
| 44773.770833333336 | 7.9 |
| 44773.78125 | 9.22 |
| 44773.791666666664 | 10.66 |
| 44773.802083333336 | 13.27 |
| 44773.8125 | 14.72 |
| 44773.822916666664 | 15.64 |
| 44773.833333333336 | 18.51 |
| 44773.84375 | 18.96 |
| 44773.854166666664 | 20.29 |
| 44773.864583333336 | 21.78 |
| 44773.875 | 22.96 |
| 44773.885416666664 | 25.13 |
| 44773.895833333336 | 23.15 |
| 44773.90625 | 20.88 |
| 44773.916666666664 | 16.9 |
| 44773.927083333336 | 16.78 |
| 44773.9375 | 13.69 |
| 44773.947916666664 | 12.18 |
| 44773.958333333336 | 12.59 |
| 44773.96875 | 12.25 |
| 44773.979166666664 | 11.82 |
| 44773.989583333336 | 11.44 |
| 44774.0 | 11.3 |
| 44774.010416666664 | 11.19 |
| 44774.020833333336 | 11.92 |
| 44774.03125 | 11.05 |
| 44774.041666666664 | 10.38 |
| 44774.052083333336 | 10.57 |
| 44774.0625 | 11.13 |
| 44774.072916666664 | 10.7 |
| 44774.083333333336 | 10.51 |
| 44774.09375 | 9.38 |
| 44774.104166666664 | 9.34 |
| 44774.114583333336 | 9.46 |
| 44774.125 | 8.84 |
| 44774.135416666664 | 8.37 |
| 44774.145833333336 | 8.26 |
| 44774.15625 | 8.43 |